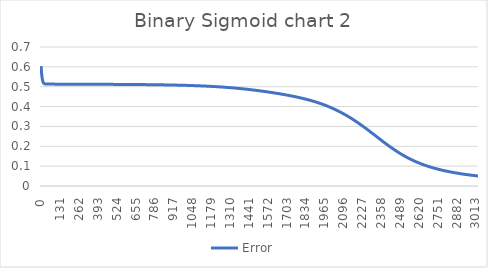
| Category | Error |
|---|---|
| 0.0 | 0.604 |
| 1.0 | 0.593 |
| 2.0 | 0.583 |
| 3.0 | 0.574 |
| 4.0 | 0.566 |
| 5.0 | 0.558 |
| 6.0 | 0.552 |
| 7.0 | 0.546 |
| 8.0 | 0.541 |
| 9.0 | 0.537 |
| 10.0 | 0.533 |
| 11.0 | 0.53 |
| 12.0 | 0.527 |
| 13.0 | 0.525 |
| 14.0 | 0.523 |
| 15.0 | 0.521 |
| 16.0 | 0.52 |
| 17.0 | 0.519 |
| 18.0 | 0.518 |
| 19.0 | 0.517 |
| 20.0 | 0.517 |
| 21.0 | 0.516 |
| 22.0 | 0.516 |
| 23.0 | 0.515 |
| 24.0 | 0.515 |
| 25.0 | 0.515 |
| 26.0 | 0.514 |
| 27.0 | 0.514 |
| 28.0 | 0.514 |
| 29.0 | 0.514 |
| 30.0 | 0.514 |
| 31.0 | 0.514 |
| 32.0 | 0.514 |
| 33.0 | 0.514 |
| 34.0 | 0.513 |
| 35.0 | 0.513 |
| 36.0 | 0.513 |
| 37.0 | 0.513 |
| 38.0 | 0.513 |
| 39.0 | 0.513 |
| 40.0 | 0.513 |
| 41.0 | 0.513 |
| 42.0 | 0.513 |
| 43.0 | 0.513 |
| 44.0 | 0.513 |
| 45.0 | 0.513 |
| 46.0 | 0.513 |
| 47.0 | 0.513 |
| 48.0 | 0.513 |
| 49.0 | 0.513 |
| 50.0 | 0.513 |
| 51.0 | 0.513 |
| 52.0 | 0.513 |
| 53.0 | 0.513 |
| 54.0 | 0.513 |
| 55.0 | 0.513 |
| 56.0 | 0.513 |
| 57.0 | 0.513 |
| 58.0 | 0.513 |
| 59.0 | 0.513 |
| 60.0 | 0.513 |
| 61.0 | 0.513 |
| 62.0 | 0.513 |
| 63.0 | 0.513 |
| 64.0 | 0.513 |
| 65.0 | 0.513 |
| 66.0 | 0.513 |
| 67.0 | 0.513 |
| 68.0 | 0.513 |
| 69.0 | 0.513 |
| 70.0 | 0.513 |
| 71.0 | 0.513 |
| 72.0 | 0.513 |
| 73.0 | 0.513 |
| 74.0 | 0.513 |
| 75.0 | 0.513 |
| 76.0 | 0.513 |
| 77.0 | 0.513 |
| 78.0 | 0.513 |
| 79.0 | 0.513 |
| 80.0 | 0.513 |
| 81.0 | 0.513 |
| 82.0 | 0.513 |
| 83.0 | 0.513 |
| 84.0 | 0.513 |
| 85.0 | 0.513 |
| 86.0 | 0.513 |
| 87.0 | 0.513 |
| 88.0 | 0.513 |
| 89.0 | 0.513 |
| 90.0 | 0.513 |
| 91.0 | 0.513 |
| 92.0 | 0.513 |
| 93.0 | 0.513 |
| 94.0 | 0.513 |
| 95.0 | 0.513 |
| 96.0 | 0.513 |
| 97.0 | 0.513 |
| 98.0 | 0.513 |
| 99.0 | 0.513 |
| 100.0 | 0.513 |
| 101.0 | 0.513 |
| 102.0 | 0.513 |
| 103.0 | 0.513 |
| 104.0 | 0.513 |
| 105.0 | 0.513 |
| 106.0 | 0.513 |
| 107.0 | 0.513 |
| 108.0 | 0.513 |
| 109.0 | 0.513 |
| 110.0 | 0.513 |
| 111.0 | 0.513 |
| 112.0 | 0.513 |
| 113.0 | 0.513 |
| 114.0 | 0.513 |
| 115.0 | 0.513 |
| 116.0 | 0.513 |
| 117.0 | 0.513 |
| 118.0 | 0.513 |
| 119.0 | 0.513 |
| 120.0 | 0.513 |
| 121.0 | 0.513 |
| 122.0 | 0.513 |
| 123.0 | 0.513 |
| 124.0 | 0.513 |
| 125.0 | 0.513 |
| 126.0 | 0.513 |
| 127.0 | 0.513 |
| 128.0 | 0.513 |
| 129.0 | 0.513 |
| 130.0 | 0.513 |
| 131.0 | 0.513 |
| 132.0 | 0.513 |
| 133.0 | 0.513 |
| 134.0 | 0.513 |
| 135.0 | 0.513 |
| 136.0 | 0.513 |
| 137.0 | 0.513 |
| 138.0 | 0.513 |
| 139.0 | 0.513 |
| 140.0 | 0.513 |
| 141.0 | 0.513 |
| 142.0 | 0.513 |
| 143.0 | 0.513 |
| 144.0 | 0.513 |
| 145.0 | 0.513 |
| 146.0 | 0.513 |
| 147.0 | 0.513 |
| 148.0 | 0.513 |
| 149.0 | 0.513 |
| 150.0 | 0.513 |
| 151.0 | 0.513 |
| 152.0 | 0.513 |
| 153.0 | 0.513 |
| 154.0 | 0.513 |
| 155.0 | 0.513 |
| 156.0 | 0.513 |
| 157.0 | 0.513 |
| 158.0 | 0.513 |
| 159.0 | 0.513 |
| 160.0 | 0.513 |
| 161.0 | 0.513 |
| 162.0 | 0.513 |
| 163.0 | 0.513 |
| 164.0 | 0.513 |
| 165.0 | 0.513 |
| 166.0 | 0.513 |
| 167.0 | 0.513 |
| 168.0 | 0.513 |
| 169.0 | 0.513 |
| 170.0 | 0.513 |
| 171.0 | 0.513 |
| 172.0 | 0.513 |
| 173.0 | 0.513 |
| 174.0 | 0.513 |
| 175.0 | 0.513 |
| 176.0 | 0.513 |
| 177.0 | 0.513 |
| 178.0 | 0.513 |
| 179.0 | 0.513 |
| 180.0 | 0.513 |
| 181.0 | 0.513 |
| 182.0 | 0.513 |
| 183.0 | 0.513 |
| 184.0 | 0.513 |
| 185.0 | 0.513 |
| 186.0 | 0.513 |
| 187.0 | 0.513 |
| 188.0 | 0.513 |
| 189.0 | 0.513 |
| 190.0 | 0.513 |
| 191.0 | 0.513 |
| 192.0 | 0.513 |
| 193.0 | 0.513 |
| 194.0 | 0.513 |
| 195.0 | 0.513 |
| 196.0 | 0.513 |
| 197.0 | 0.513 |
| 198.0 | 0.513 |
| 199.0 | 0.513 |
| 200.0 | 0.513 |
| 201.0 | 0.513 |
| 202.0 | 0.513 |
| 203.0 | 0.513 |
| 204.0 | 0.513 |
| 205.0 | 0.513 |
| 206.0 | 0.513 |
| 207.0 | 0.513 |
| 208.0 | 0.513 |
| 209.0 | 0.513 |
| 210.0 | 0.513 |
| 211.0 | 0.513 |
| 212.0 | 0.513 |
| 213.0 | 0.513 |
| 214.0 | 0.513 |
| 215.0 | 0.513 |
| 216.0 | 0.513 |
| 217.0 | 0.513 |
| 218.0 | 0.513 |
| 219.0 | 0.513 |
| 220.0 | 0.513 |
| 221.0 | 0.513 |
| 222.0 | 0.513 |
| 223.0 | 0.513 |
| 224.0 | 0.513 |
| 225.0 | 0.513 |
| 226.0 | 0.513 |
| 227.0 | 0.513 |
| 228.0 | 0.513 |
| 229.0 | 0.513 |
| 230.0 | 0.513 |
| 231.0 | 0.513 |
| 232.0 | 0.513 |
| 233.0 | 0.513 |
| 234.0 | 0.513 |
| 235.0 | 0.513 |
| 236.0 | 0.513 |
| 237.0 | 0.513 |
| 238.0 | 0.513 |
| 239.0 | 0.513 |
| 240.0 | 0.513 |
| 241.0 | 0.513 |
| 242.0 | 0.513 |
| 243.0 | 0.513 |
| 244.0 | 0.513 |
| 245.0 | 0.513 |
| 246.0 | 0.513 |
| 247.0 | 0.513 |
| 248.0 | 0.513 |
| 249.0 | 0.513 |
| 250.0 | 0.513 |
| 251.0 | 0.513 |
| 252.0 | 0.513 |
| 253.0 | 0.513 |
| 254.0 | 0.513 |
| 255.0 | 0.513 |
| 256.0 | 0.513 |
| 257.0 | 0.513 |
| 258.0 | 0.513 |
| 259.0 | 0.513 |
| 260.0 | 0.513 |
| 261.0 | 0.513 |
| 262.0 | 0.513 |
| 263.0 | 0.513 |
| 264.0 | 0.513 |
| 265.0 | 0.513 |
| 266.0 | 0.513 |
| 267.0 | 0.513 |
| 268.0 | 0.513 |
| 269.0 | 0.513 |
| 270.0 | 0.513 |
| 271.0 | 0.513 |
| 272.0 | 0.513 |
| 273.0 | 0.513 |
| 274.0 | 0.513 |
| 275.0 | 0.513 |
| 276.0 | 0.513 |
| 277.0 | 0.513 |
| 278.0 | 0.513 |
| 279.0 | 0.513 |
| 280.0 | 0.512 |
| 281.0 | 0.512 |
| 282.0 | 0.512 |
| 283.0 | 0.512 |
| 284.0 | 0.512 |
| 285.0 | 0.512 |
| 286.0 | 0.512 |
| 287.0 | 0.512 |
| 288.0 | 0.512 |
| 289.0 | 0.512 |
| 290.0 | 0.512 |
| 291.0 | 0.512 |
| 292.0 | 0.512 |
| 293.0 | 0.512 |
| 294.0 | 0.512 |
| 295.0 | 0.512 |
| 296.0 | 0.512 |
| 297.0 | 0.512 |
| 298.0 | 0.512 |
| 299.0 | 0.512 |
| 300.0 | 0.512 |
| 301.0 | 0.512 |
| 302.0 | 0.512 |
| 303.0 | 0.512 |
| 304.0 | 0.512 |
| 305.0 | 0.512 |
| 306.0 | 0.512 |
| 307.0 | 0.512 |
| 308.0 | 0.512 |
| 309.0 | 0.512 |
| 310.0 | 0.512 |
| 311.0 | 0.512 |
| 312.0 | 0.512 |
| 313.0 | 0.512 |
| 314.0 | 0.512 |
| 315.0 | 0.512 |
| 316.0 | 0.512 |
| 317.0 | 0.512 |
| 318.0 | 0.512 |
| 319.0 | 0.512 |
| 320.0 | 0.512 |
| 321.0 | 0.512 |
| 322.0 | 0.512 |
| 323.0 | 0.512 |
| 324.0 | 0.512 |
| 325.0 | 0.512 |
| 326.0 | 0.512 |
| 327.0 | 0.512 |
| 328.0 | 0.512 |
| 329.0 | 0.512 |
| 330.0 | 0.512 |
| 331.0 | 0.512 |
| 332.0 | 0.512 |
| 333.0 | 0.512 |
| 334.0 | 0.512 |
| 335.0 | 0.512 |
| 336.0 | 0.512 |
| 337.0 | 0.512 |
| 338.0 | 0.512 |
| 339.0 | 0.512 |
| 340.0 | 0.512 |
| 341.0 | 0.512 |
| 342.0 | 0.512 |
| 343.0 | 0.512 |
| 344.0 | 0.512 |
| 345.0 | 0.512 |
| 346.0 | 0.512 |
| 347.0 | 0.512 |
| 348.0 | 0.512 |
| 349.0 | 0.512 |
| 350.0 | 0.512 |
| 351.0 | 0.512 |
| 352.0 | 0.512 |
| 353.0 | 0.512 |
| 354.0 | 0.512 |
| 355.0 | 0.512 |
| 356.0 | 0.512 |
| 357.0 | 0.512 |
| 358.0 | 0.512 |
| 359.0 | 0.512 |
| 360.0 | 0.512 |
| 361.0 | 0.512 |
| 362.0 | 0.512 |
| 363.0 | 0.512 |
| 364.0 | 0.512 |
| 365.0 | 0.512 |
| 366.0 | 0.512 |
| 367.0 | 0.512 |
| 368.0 | 0.512 |
| 369.0 | 0.512 |
| 370.0 | 0.512 |
| 371.0 | 0.512 |
| 372.0 | 0.512 |
| 373.0 | 0.512 |
| 374.0 | 0.512 |
| 375.0 | 0.512 |
| 376.0 | 0.512 |
| 377.0 | 0.512 |
| 378.0 | 0.512 |
| 379.0 | 0.512 |
| 380.0 | 0.512 |
| 381.0 | 0.512 |
| 382.0 | 0.512 |
| 383.0 | 0.512 |
| 384.0 | 0.512 |
| 385.0 | 0.512 |
| 386.0 | 0.512 |
| 387.0 | 0.512 |
| 388.0 | 0.512 |
| 389.0 | 0.512 |
| 390.0 | 0.512 |
| 391.0 | 0.512 |
| 392.0 | 0.512 |
| 393.0 | 0.512 |
| 394.0 | 0.512 |
| 395.0 | 0.512 |
| 396.0 | 0.512 |
| 397.0 | 0.512 |
| 398.0 | 0.512 |
| 399.0 | 0.512 |
| 400.0 | 0.512 |
| 401.0 | 0.512 |
| 402.0 | 0.512 |
| 403.0 | 0.512 |
| 404.0 | 0.512 |
| 405.0 | 0.512 |
| 406.0 | 0.512 |
| 407.0 | 0.512 |
| 408.0 | 0.512 |
| 409.0 | 0.512 |
| 410.0 | 0.512 |
| 411.0 | 0.512 |
| 412.0 | 0.512 |
| 413.0 | 0.512 |
| 414.0 | 0.512 |
| 415.0 | 0.512 |
| 416.0 | 0.512 |
| 417.0 | 0.512 |
| 418.0 | 0.512 |
| 419.0 | 0.512 |
| 420.0 | 0.512 |
| 421.0 | 0.512 |
| 422.0 | 0.512 |
| 423.0 | 0.512 |
| 424.0 | 0.512 |
| 425.0 | 0.512 |
| 426.0 | 0.512 |
| 427.0 | 0.512 |
| 428.0 | 0.512 |
| 429.0 | 0.512 |
| 430.0 | 0.512 |
| 431.0 | 0.512 |
| 432.0 | 0.512 |
| 433.0 | 0.512 |
| 434.0 | 0.512 |
| 435.0 | 0.512 |
| 436.0 | 0.512 |
| 437.0 | 0.512 |
| 438.0 | 0.512 |
| 439.0 | 0.512 |
| 440.0 | 0.512 |
| 441.0 | 0.512 |
| 442.0 | 0.512 |
| 443.0 | 0.512 |
| 444.0 | 0.512 |
| 445.0 | 0.512 |
| 446.0 | 0.512 |
| 447.0 | 0.512 |
| 448.0 | 0.512 |
| 449.0 | 0.512 |
| 450.0 | 0.512 |
| 451.0 | 0.512 |
| 452.0 | 0.512 |
| 453.0 | 0.512 |
| 454.0 | 0.512 |
| 455.0 | 0.512 |
| 456.0 | 0.512 |
| 457.0 | 0.512 |
| 458.0 | 0.512 |
| 459.0 | 0.512 |
| 460.0 | 0.512 |
| 461.0 | 0.512 |
| 462.0 | 0.512 |
| 463.0 | 0.512 |
| 464.0 | 0.512 |
| 465.0 | 0.512 |
| 466.0 | 0.512 |
| 467.0 | 0.512 |
| 468.0 | 0.512 |
| 469.0 | 0.512 |
| 470.0 | 0.512 |
| 471.0 | 0.512 |
| 472.0 | 0.512 |
| 473.0 | 0.512 |
| 474.0 | 0.512 |
| 475.0 | 0.512 |
| 476.0 | 0.512 |
| 477.0 | 0.512 |
| 478.0 | 0.512 |
| 479.0 | 0.512 |
| 480.0 | 0.512 |
| 481.0 | 0.512 |
| 482.0 | 0.512 |
| 483.0 | 0.512 |
| 484.0 | 0.512 |
| 485.0 | 0.512 |
| 486.0 | 0.512 |
| 487.0 | 0.512 |
| 488.0 | 0.512 |
| 489.0 | 0.512 |
| 490.0 | 0.512 |
| 491.0 | 0.512 |
| 492.0 | 0.512 |
| 493.0 | 0.512 |
| 494.0 | 0.512 |
| 495.0 | 0.512 |
| 496.0 | 0.512 |
| 497.0 | 0.512 |
| 498.0 | 0.512 |
| 499.0 | 0.512 |
| 500.0 | 0.512 |
| 501.0 | 0.512 |
| 502.0 | 0.512 |
| 503.0 | 0.512 |
| 504.0 | 0.512 |
| 505.0 | 0.512 |
| 506.0 | 0.512 |
| 507.0 | 0.512 |
| 508.0 | 0.512 |
| 509.0 | 0.512 |
| 510.0 | 0.512 |
| 511.0 | 0.512 |
| 512.0 | 0.512 |
| 513.0 | 0.512 |
| 514.0 | 0.512 |
| 515.0 | 0.512 |
| 516.0 | 0.512 |
| 517.0 | 0.512 |
| 518.0 | 0.512 |
| 519.0 | 0.512 |
| 520.0 | 0.512 |
| 521.0 | 0.512 |
| 522.0 | 0.512 |
| 523.0 | 0.512 |
| 524.0 | 0.512 |
| 525.0 | 0.512 |
| 526.0 | 0.512 |
| 527.0 | 0.512 |
| 528.0 | 0.512 |
| 529.0 | 0.512 |
| 530.0 | 0.512 |
| 531.0 | 0.512 |
| 532.0 | 0.512 |
| 533.0 | 0.512 |
| 534.0 | 0.512 |
| 535.0 | 0.512 |
| 536.0 | 0.512 |
| 537.0 | 0.512 |
| 538.0 | 0.512 |
| 539.0 | 0.512 |
| 540.0 | 0.512 |
| 541.0 | 0.512 |
| 542.0 | 0.512 |
| 543.0 | 0.512 |
| 544.0 | 0.512 |
| 545.0 | 0.512 |
| 546.0 | 0.512 |
| 547.0 | 0.512 |
| 548.0 | 0.512 |
| 549.0 | 0.512 |
| 550.0 | 0.512 |
| 551.0 | 0.512 |
| 552.0 | 0.512 |
| 553.0 | 0.512 |
| 554.0 | 0.512 |
| 555.0 | 0.512 |
| 556.0 | 0.512 |
| 557.0 | 0.512 |
| 558.0 | 0.512 |
| 559.0 | 0.512 |
| 560.0 | 0.512 |
| 561.0 | 0.512 |
| 562.0 | 0.512 |
| 563.0 | 0.512 |
| 564.0 | 0.512 |
| 565.0 | 0.512 |
| 566.0 | 0.512 |
| 567.0 | 0.511 |
| 568.0 | 0.511 |
| 569.0 | 0.511 |
| 570.0 | 0.511 |
| 571.0 | 0.511 |
| 572.0 | 0.511 |
| 573.0 | 0.511 |
| 574.0 | 0.511 |
| 575.0 | 0.511 |
| 576.0 | 0.511 |
| 577.0 | 0.511 |
| 578.0 | 0.511 |
| 579.0 | 0.511 |
| 580.0 | 0.511 |
| 581.0 | 0.511 |
| 582.0 | 0.511 |
| 583.0 | 0.511 |
| 584.0 | 0.511 |
| 585.0 | 0.511 |
| 586.0 | 0.511 |
| 587.0 | 0.511 |
| 588.0 | 0.511 |
| 589.0 | 0.511 |
| 590.0 | 0.511 |
| 591.0 | 0.511 |
| 592.0 | 0.511 |
| 593.0 | 0.511 |
| 594.0 | 0.511 |
| 595.0 | 0.511 |
| 596.0 | 0.511 |
| 597.0 | 0.511 |
| 598.0 | 0.511 |
| 599.0 | 0.511 |
| 600.0 | 0.511 |
| 601.0 | 0.511 |
| 602.0 | 0.511 |
| 603.0 | 0.511 |
| 604.0 | 0.511 |
| 605.0 | 0.511 |
| 606.0 | 0.511 |
| 607.0 | 0.511 |
| 608.0 | 0.511 |
| 609.0 | 0.511 |
| 610.0 | 0.511 |
| 611.0 | 0.511 |
| 612.0 | 0.511 |
| 613.0 | 0.511 |
| 614.0 | 0.511 |
| 615.0 | 0.511 |
| 616.0 | 0.511 |
| 617.0 | 0.511 |
| 618.0 | 0.511 |
| 619.0 | 0.511 |
| 620.0 | 0.511 |
| 621.0 | 0.511 |
| 622.0 | 0.511 |
| 623.0 | 0.511 |
| 624.0 | 0.511 |
| 625.0 | 0.511 |
| 626.0 | 0.511 |
| 627.0 | 0.511 |
| 628.0 | 0.511 |
| 629.0 | 0.511 |
| 630.0 | 0.511 |
| 631.0 | 0.511 |
| 632.0 | 0.511 |
| 633.0 | 0.511 |
| 634.0 | 0.511 |
| 635.0 | 0.511 |
| 636.0 | 0.511 |
| 637.0 | 0.511 |
| 638.0 | 0.511 |
| 639.0 | 0.511 |
| 640.0 | 0.511 |
| 641.0 | 0.511 |
| 642.0 | 0.511 |
| 643.0 | 0.511 |
| 644.0 | 0.511 |
| 645.0 | 0.511 |
| 646.0 | 0.511 |
| 647.0 | 0.511 |
| 648.0 | 0.511 |
| 649.0 | 0.511 |
| 650.0 | 0.511 |
| 651.0 | 0.511 |
| 652.0 | 0.511 |
| 653.0 | 0.511 |
| 654.0 | 0.511 |
| 655.0 | 0.511 |
| 656.0 | 0.511 |
| 657.0 | 0.511 |
| 658.0 | 0.511 |
| 659.0 | 0.511 |
| 660.0 | 0.511 |
| 661.0 | 0.511 |
| 662.0 | 0.511 |
| 663.0 | 0.511 |
| 664.0 | 0.511 |
| 665.0 | 0.511 |
| 666.0 | 0.511 |
| 667.0 | 0.511 |
| 668.0 | 0.511 |
| 669.0 | 0.511 |
| 670.0 | 0.511 |
| 671.0 | 0.511 |
| 672.0 | 0.511 |
| 673.0 | 0.511 |
| 674.0 | 0.511 |
| 675.0 | 0.511 |
| 676.0 | 0.511 |
| 677.0 | 0.511 |
| 678.0 | 0.511 |
| 679.0 | 0.511 |
| 680.0 | 0.511 |
| 681.0 | 0.511 |
| 682.0 | 0.511 |
| 683.0 | 0.511 |
| 684.0 | 0.511 |
| 685.0 | 0.511 |
| 686.0 | 0.511 |
| 687.0 | 0.511 |
| 688.0 | 0.511 |
| 689.0 | 0.511 |
| 690.0 | 0.511 |
| 691.0 | 0.511 |
| 692.0 | 0.511 |
| 693.0 | 0.511 |
| 694.0 | 0.511 |
| 695.0 | 0.511 |
| 696.0 | 0.511 |
| 697.0 | 0.511 |
| 698.0 | 0.511 |
| 699.0 | 0.511 |
| 700.0 | 0.511 |
| 701.0 | 0.511 |
| 702.0 | 0.511 |
| 703.0 | 0.511 |
| 704.0 | 0.511 |
| 705.0 | 0.511 |
| 706.0 | 0.511 |
| 707.0 | 0.511 |
| 708.0 | 0.511 |
| 709.0 | 0.511 |
| 710.0 | 0.511 |
| 711.0 | 0.511 |
| 712.0 | 0.511 |
| 713.0 | 0.511 |
| 714.0 | 0.511 |
| 715.0 | 0.511 |
| 716.0 | 0.511 |
| 717.0 | 0.511 |
| 718.0 | 0.511 |
| 719.0 | 0.511 |
| 720.0 | 0.511 |
| 721.0 | 0.511 |
| 722.0 | 0.511 |
| 723.0 | 0.511 |
| 724.0 | 0.511 |
| 725.0 | 0.511 |
| 726.0 | 0.511 |
| 727.0 | 0.511 |
| 728.0 | 0.511 |
| 729.0 | 0.51 |
| 730.0 | 0.51 |
| 731.0 | 0.51 |
| 732.0 | 0.51 |
| 733.0 | 0.51 |
| 734.0 | 0.51 |
| 735.0 | 0.51 |
| 736.0 | 0.51 |
| 737.0 | 0.51 |
| 738.0 | 0.51 |
| 739.0 | 0.51 |
| 740.0 | 0.51 |
| 741.0 | 0.51 |
| 742.0 | 0.51 |
| 743.0 | 0.51 |
| 744.0 | 0.51 |
| 745.0 | 0.51 |
| 746.0 | 0.51 |
| 747.0 | 0.51 |
| 748.0 | 0.51 |
| 749.0 | 0.51 |
| 750.0 | 0.51 |
| 751.0 | 0.51 |
| 752.0 | 0.51 |
| 753.0 | 0.51 |
| 754.0 | 0.51 |
| 755.0 | 0.51 |
| 756.0 | 0.51 |
| 757.0 | 0.51 |
| 758.0 | 0.51 |
| 759.0 | 0.51 |
| 760.0 | 0.51 |
| 761.0 | 0.51 |
| 762.0 | 0.51 |
| 763.0 | 0.51 |
| 764.0 | 0.51 |
| 765.0 | 0.51 |
| 766.0 | 0.51 |
| 767.0 | 0.51 |
| 768.0 | 0.51 |
| 769.0 | 0.51 |
| 770.0 | 0.51 |
| 771.0 | 0.51 |
| 772.0 | 0.51 |
| 773.0 | 0.51 |
| 774.0 | 0.51 |
| 775.0 | 0.51 |
| 776.0 | 0.51 |
| 777.0 | 0.51 |
| 778.0 | 0.51 |
| 779.0 | 0.51 |
| 780.0 | 0.51 |
| 781.0 | 0.51 |
| 782.0 | 0.51 |
| 783.0 | 0.51 |
| 784.0 | 0.51 |
| 785.0 | 0.51 |
| 786.0 | 0.51 |
| 787.0 | 0.51 |
| 788.0 | 0.51 |
| 789.0 | 0.51 |
| 790.0 | 0.51 |
| 791.0 | 0.51 |
| 792.0 | 0.51 |
| 793.0 | 0.51 |
| 794.0 | 0.51 |
| 795.0 | 0.51 |
| 796.0 | 0.51 |
| 797.0 | 0.51 |
| 798.0 | 0.51 |
| 799.0 | 0.51 |
| 800.0 | 0.51 |
| 801.0 | 0.51 |
| 802.0 | 0.51 |
| 803.0 | 0.51 |
| 804.0 | 0.51 |
| 805.0 | 0.51 |
| 806.0 | 0.51 |
| 807.0 | 0.51 |
| 808.0 | 0.51 |
| 809.0 | 0.51 |
| 810.0 | 0.51 |
| 811.0 | 0.51 |
| 812.0 | 0.51 |
| 813.0 | 0.51 |
| 814.0 | 0.51 |
| 815.0 | 0.51 |
| 816.0 | 0.51 |
| 817.0 | 0.51 |
| 818.0 | 0.51 |
| 819.0 | 0.51 |
| 820.0 | 0.51 |
| 821.0 | 0.51 |
| 822.0 | 0.51 |
| 823.0 | 0.51 |
| 824.0 | 0.51 |
| 825.0 | 0.51 |
| 826.0 | 0.51 |
| 827.0 | 0.51 |
| 828.0 | 0.51 |
| 829.0 | 0.51 |
| 830.0 | 0.51 |
| 831.0 | 0.51 |
| 832.0 | 0.51 |
| 833.0 | 0.51 |
| 834.0 | 0.509 |
| 835.0 | 0.509 |
| 836.0 | 0.509 |
| 837.0 | 0.509 |
| 838.0 | 0.509 |
| 839.0 | 0.509 |
| 840.0 | 0.509 |
| 841.0 | 0.509 |
| 842.0 | 0.509 |
| 843.0 | 0.509 |
| 844.0 | 0.509 |
| 845.0 | 0.509 |
| 846.0 | 0.509 |
| 847.0 | 0.509 |
| 848.0 | 0.509 |
| 849.0 | 0.509 |
| 850.0 | 0.509 |
| 851.0 | 0.509 |
| 852.0 | 0.509 |
| 853.0 | 0.509 |
| 854.0 | 0.509 |
| 855.0 | 0.509 |
| 856.0 | 0.509 |
| 857.0 | 0.509 |
| 858.0 | 0.509 |
| 859.0 | 0.509 |
| 860.0 | 0.509 |
| 861.0 | 0.509 |
| 862.0 | 0.509 |
| 863.0 | 0.509 |
| 864.0 | 0.509 |
| 865.0 | 0.509 |
| 866.0 | 0.509 |
| 867.0 | 0.509 |
| 868.0 | 0.509 |
| 869.0 | 0.509 |
| 870.0 | 0.509 |
| 871.0 | 0.509 |
| 872.0 | 0.509 |
| 873.0 | 0.509 |
| 874.0 | 0.509 |
| 875.0 | 0.509 |
| 876.0 | 0.509 |
| 877.0 | 0.509 |
| 878.0 | 0.509 |
| 879.0 | 0.509 |
| 880.0 | 0.509 |
| 881.0 | 0.509 |
| 882.0 | 0.509 |
| 883.0 | 0.509 |
| 884.0 | 0.509 |
| 885.0 | 0.509 |
| 886.0 | 0.509 |
| 887.0 | 0.509 |
| 888.0 | 0.509 |
| 889.0 | 0.509 |
| 890.0 | 0.509 |
| 891.0 | 0.509 |
| 892.0 | 0.509 |
| 893.0 | 0.509 |
| 894.0 | 0.509 |
| 895.0 | 0.509 |
| 896.0 | 0.509 |
| 897.0 | 0.509 |
| 898.0 | 0.509 |
| 899.0 | 0.509 |
| 900.0 | 0.509 |
| 901.0 | 0.509 |
| 902.0 | 0.509 |
| 903.0 | 0.509 |
| 904.0 | 0.509 |
| 905.0 | 0.509 |
| 906.0 | 0.509 |
| 907.0 | 0.509 |
| 908.0 | 0.509 |
| 909.0 | 0.509 |
| 910.0 | 0.509 |
| 911.0 | 0.508 |
| 912.0 | 0.508 |
| 913.0 | 0.508 |
| 914.0 | 0.508 |
| 915.0 | 0.508 |
| 916.0 | 0.508 |
| 917.0 | 0.508 |
| 918.0 | 0.508 |
| 919.0 | 0.508 |
| 920.0 | 0.508 |
| 921.0 | 0.508 |
| 922.0 | 0.508 |
| 923.0 | 0.508 |
| 924.0 | 0.508 |
| 925.0 | 0.508 |
| 926.0 | 0.508 |
| 927.0 | 0.508 |
| 928.0 | 0.508 |
| 929.0 | 0.508 |
| 930.0 | 0.508 |
| 931.0 | 0.508 |
| 932.0 | 0.508 |
| 933.0 | 0.508 |
| 934.0 | 0.508 |
| 935.0 | 0.508 |
| 936.0 | 0.508 |
| 937.0 | 0.508 |
| 938.0 | 0.508 |
| 939.0 | 0.508 |
| 940.0 | 0.508 |
| 941.0 | 0.508 |
| 942.0 | 0.508 |
| 943.0 | 0.508 |
| 944.0 | 0.508 |
| 945.0 | 0.508 |
| 946.0 | 0.508 |
| 947.0 | 0.508 |
| 948.0 | 0.508 |
| 949.0 | 0.508 |
| 950.0 | 0.508 |
| 951.0 | 0.508 |
| 952.0 | 0.508 |
| 953.0 | 0.508 |
| 954.0 | 0.508 |
| 955.0 | 0.508 |
| 956.0 | 0.508 |
| 957.0 | 0.508 |
| 958.0 | 0.508 |
| 959.0 | 0.508 |
| 960.0 | 0.508 |
| 961.0 | 0.508 |
| 962.0 | 0.508 |
| 963.0 | 0.508 |
| 964.0 | 0.508 |
| 965.0 | 0.508 |
| 966.0 | 0.508 |
| 967.0 | 0.508 |
| 968.0 | 0.508 |
| 969.0 | 0.508 |
| 970.0 | 0.507 |
| 971.0 | 0.507 |
| 972.0 | 0.507 |
| 973.0 | 0.507 |
| 974.0 | 0.507 |
| 975.0 | 0.507 |
| 976.0 | 0.507 |
| 977.0 | 0.507 |
| 978.0 | 0.507 |
| 979.0 | 0.507 |
| 980.0 | 0.507 |
| 981.0 | 0.507 |
| 982.0 | 0.507 |
| 983.0 | 0.507 |
| 984.0 | 0.507 |
| 985.0 | 0.507 |
| 986.0 | 0.507 |
| 987.0 | 0.507 |
| 988.0 | 0.507 |
| 989.0 | 0.507 |
| 990.0 | 0.507 |
| 991.0 | 0.507 |
| 992.0 | 0.507 |
| 993.0 | 0.507 |
| 994.0 | 0.507 |
| 995.0 | 0.507 |
| 996.0 | 0.507 |
| 997.0 | 0.507 |
| 998.0 | 0.507 |
| 999.0 | 0.507 |
| 1000.0 | 0.507 |
| 1001.0 | 0.507 |
| 1002.0 | 0.507 |
| 1003.0 | 0.507 |
| 1004.0 | 0.507 |
| 1005.0 | 0.507 |
| 1006.0 | 0.507 |
| 1007.0 | 0.507 |
| 1008.0 | 0.507 |
| 1009.0 | 0.507 |
| 1010.0 | 0.507 |
| 1011.0 | 0.507 |
| 1012.0 | 0.507 |
| 1013.0 | 0.507 |
| 1014.0 | 0.507 |
| 1015.0 | 0.507 |
| 1016.0 | 0.507 |
| 1017.0 | 0.507 |
| 1018.0 | 0.507 |
| 1019.0 | 0.506 |
| 1020.0 | 0.506 |
| 1021.0 | 0.506 |
| 1022.0 | 0.506 |
| 1023.0 | 0.506 |
| 1024.0 | 0.506 |
| 1025.0 | 0.506 |
| 1026.0 | 0.506 |
| 1027.0 | 0.506 |
| 1028.0 | 0.506 |
| 1029.0 | 0.506 |
| 1030.0 | 0.506 |
| 1031.0 | 0.506 |
| 1032.0 | 0.506 |
| 1033.0 | 0.506 |
| 1034.0 | 0.506 |
| 1035.0 | 0.506 |
| 1036.0 | 0.506 |
| 1037.0 | 0.506 |
| 1038.0 | 0.506 |
| 1039.0 | 0.506 |
| 1040.0 | 0.506 |
| 1041.0 | 0.506 |
| 1042.0 | 0.506 |
| 1043.0 | 0.506 |
| 1044.0 | 0.506 |
| 1045.0 | 0.506 |
| 1046.0 | 0.506 |
| 1047.0 | 0.506 |
| 1048.0 | 0.506 |
| 1049.0 | 0.506 |
| 1050.0 | 0.506 |
| 1051.0 | 0.506 |
| 1052.0 | 0.506 |
| 1053.0 | 0.506 |
| 1054.0 | 0.506 |
| 1055.0 | 0.506 |
| 1056.0 | 0.506 |
| 1057.0 | 0.506 |
| 1058.0 | 0.506 |
| 1059.0 | 0.506 |
| 1060.0 | 0.506 |
| 1061.0 | 0.505 |
| 1062.0 | 0.505 |
| 1063.0 | 0.505 |
| 1064.0 | 0.505 |
| 1065.0 | 0.505 |
| 1066.0 | 0.505 |
| 1067.0 | 0.505 |
| 1068.0 | 0.505 |
| 1069.0 | 0.505 |
| 1070.0 | 0.505 |
| 1071.0 | 0.505 |
| 1072.0 | 0.505 |
| 1073.0 | 0.505 |
| 1074.0 | 0.505 |
| 1075.0 | 0.505 |
| 1076.0 | 0.505 |
| 1077.0 | 0.505 |
| 1078.0 | 0.505 |
| 1079.0 | 0.505 |
| 1080.0 | 0.505 |
| 1081.0 | 0.505 |
| 1082.0 | 0.505 |
| 1083.0 | 0.505 |
| 1084.0 | 0.505 |
| 1085.0 | 0.505 |
| 1086.0 | 0.505 |
| 1087.0 | 0.505 |
| 1088.0 | 0.505 |
| 1089.0 | 0.505 |
| 1090.0 | 0.505 |
| 1091.0 | 0.505 |
| 1092.0 | 0.505 |
| 1093.0 | 0.505 |
| 1094.0 | 0.505 |
| 1095.0 | 0.505 |
| 1096.0 | 0.505 |
| 1097.0 | 0.504 |
| 1098.0 | 0.504 |
| 1099.0 | 0.504 |
| 1100.0 | 0.504 |
| 1101.0 | 0.504 |
| 1102.0 | 0.504 |
| 1103.0 | 0.504 |
| 1104.0 | 0.504 |
| 1105.0 | 0.504 |
| 1106.0 | 0.504 |
| 1107.0 | 0.504 |
| 1108.0 | 0.504 |
| 1109.0 | 0.504 |
| 1110.0 | 0.504 |
| 1111.0 | 0.504 |
| 1112.0 | 0.504 |
| 1113.0 | 0.504 |
| 1114.0 | 0.504 |
| 1115.0 | 0.504 |
| 1116.0 | 0.504 |
| 1117.0 | 0.504 |
| 1118.0 | 0.504 |
| 1119.0 | 0.504 |
| 1120.0 | 0.504 |
| 1121.0 | 0.504 |
| 1122.0 | 0.504 |
| 1123.0 | 0.504 |
| 1124.0 | 0.504 |
| 1125.0 | 0.504 |
| 1126.0 | 0.504 |
| 1127.0 | 0.504 |
| 1128.0 | 0.504 |
| 1129.0 | 0.503 |
| 1130.0 | 0.503 |
| 1131.0 | 0.503 |
| 1132.0 | 0.503 |
| 1133.0 | 0.503 |
| 1134.0 | 0.503 |
| 1135.0 | 0.503 |
| 1136.0 | 0.503 |
| 1137.0 | 0.503 |
| 1138.0 | 0.503 |
| 1139.0 | 0.503 |
| 1140.0 | 0.503 |
| 1141.0 | 0.503 |
| 1142.0 | 0.503 |
| 1143.0 | 0.503 |
| 1144.0 | 0.503 |
| 1145.0 | 0.503 |
| 1146.0 | 0.503 |
| 1147.0 | 0.503 |
| 1148.0 | 0.503 |
| 1149.0 | 0.503 |
| 1150.0 | 0.503 |
| 1151.0 | 0.503 |
| 1152.0 | 0.503 |
| 1153.0 | 0.503 |
| 1154.0 | 0.503 |
| 1155.0 | 0.503 |
| 1156.0 | 0.503 |
| 1157.0 | 0.503 |
| 1158.0 | 0.502 |
| 1159.0 | 0.502 |
| 1160.0 | 0.502 |
| 1161.0 | 0.502 |
| 1162.0 | 0.502 |
| 1163.0 | 0.502 |
| 1164.0 | 0.502 |
| 1165.0 | 0.502 |
| 1166.0 | 0.502 |
| 1167.0 | 0.502 |
| 1168.0 | 0.502 |
| 1169.0 | 0.502 |
| 1170.0 | 0.502 |
| 1171.0 | 0.502 |
| 1172.0 | 0.502 |
| 1173.0 | 0.502 |
| 1174.0 | 0.502 |
| 1175.0 | 0.502 |
| 1176.0 | 0.502 |
| 1177.0 | 0.502 |
| 1178.0 | 0.502 |
| 1179.0 | 0.502 |
| 1180.0 | 0.502 |
| 1181.0 | 0.502 |
| 1182.0 | 0.502 |
| 1183.0 | 0.502 |
| 1184.0 | 0.502 |
| 1185.0 | 0.501 |
| 1186.0 | 0.501 |
| 1187.0 | 0.501 |
| 1188.0 | 0.501 |
| 1189.0 | 0.501 |
| 1190.0 | 0.501 |
| 1191.0 | 0.501 |
| 1192.0 | 0.501 |
| 1193.0 | 0.501 |
| 1194.0 | 0.501 |
| 1195.0 | 0.501 |
| 1196.0 | 0.501 |
| 1197.0 | 0.501 |
| 1198.0 | 0.501 |
| 1199.0 | 0.501 |
| 1200.0 | 0.501 |
| 1201.0 | 0.501 |
| 1202.0 | 0.501 |
| 1203.0 | 0.501 |
| 1204.0 | 0.501 |
| 1205.0 | 0.501 |
| 1206.0 | 0.501 |
| 1207.0 | 0.501 |
| 1208.0 | 0.501 |
| 1209.0 | 0.5 |
| 1210.0 | 0.5 |
| 1211.0 | 0.5 |
| 1212.0 | 0.5 |
| 1213.0 | 0.5 |
| 1214.0 | 0.5 |
| 1215.0 | 0.5 |
| 1216.0 | 0.5 |
| 1217.0 | 0.5 |
| 1218.0 | 0.5 |
| 1219.0 | 0.5 |
| 1220.0 | 0.5 |
| 1221.0 | 0.5 |
| 1222.0 | 0.5 |
| 1223.0 | 0.5 |
| 1224.0 | 0.5 |
| 1225.0 | 0.5 |
| 1226.0 | 0.5 |
| 1227.0 | 0.5 |
| 1228.0 | 0.5 |
| 1229.0 | 0.5 |
| 1230.0 | 0.5 |
| 1231.0 | 0.499 |
| 1232.0 | 0.499 |
| 1233.0 | 0.499 |
| 1234.0 | 0.499 |
| 1235.0 | 0.499 |
| 1236.0 | 0.499 |
| 1237.0 | 0.499 |
| 1238.0 | 0.499 |
| 1239.0 | 0.499 |
| 1240.0 | 0.499 |
| 1241.0 | 0.499 |
| 1242.0 | 0.499 |
| 1243.0 | 0.499 |
| 1244.0 | 0.499 |
| 1245.0 | 0.499 |
| 1246.0 | 0.499 |
| 1247.0 | 0.499 |
| 1248.0 | 0.499 |
| 1249.0 | 0.499 |
| 1250.0 | 0.499 |
| 1251.0 | 0.499 |
| 1252.0 | 0.498 |
| 1253.0 | 0.498 |
| 1254.0 | 0.498 |
| 1255.0 | 0.498 |
| 1256.0 | 0.498 |
| 1257.0 | 0.498 |
| 1258.0 | 0.498 |
| 1259.0 | 0.498 |
| 1260.0 | 0.498 |
| 1261.0 | 0.498 |
| 1262.0 | 0.498 |
| 1263.0 | 0.498 |
| 1264.0 | 0.498 |
| 1265.0 | 0.498 |
| 1266.0 | 0.498 |
| 1267.0 | 0.498 |
| 1268.0 | 0.498 |
| 1269.0 | 0.498 |
| 1270.0 | 0.498 |
| 1271.0 | 0.497 |
| 1272.0 | 0.497 |
| 1273.0 | 0.497 |
| 1274.0 | 0.497 |
| 1275.0 | 0.497 |
| 1276.0 | 0.497 |
| 1277.0 | 0.497 |
| 1278.0 | 0.497 |
| 1279.0 | 0.497 |
| 1280.0 | 0.497 |
| 1281.0 | 0.497 |
| 1282.0 | 0.497 |
| 1283.0 | 0.497 |
| 1284.0 | 0.497 |
| 1285.0 | 0.497 |
| 1286.0 | 0.497 |
| 1287.0 | 0.497 |
| 1288.0 | 0.497 |
| 1289.0 | 0.497 |
| 1290.0 | 0.496 |
| 1291.0 | 0.496 |
| 1292.0 | 0.496 |
| 1293.0 | 0.496 |
| 1294.0 | 0.496 |
| 1295.0 | 0.496 |
| 1296.0 | 0.496 |
| 1297.0 | 0.496 |
| 1298.0 | 0.496 |
| 1299.0 | 0.496 |
| 1300.0 | 0.496 |
| 1301.0 | 0.496 |
| 1302.0 | 0.496 |
| 1303.0 | 0.496 |
| 1304.0 | 0.496 |
| 1305.0 | 0.496 |
| 1306.0 | 0.496 |
| 1307.0 | 0.495 |
| 1308.0 | 0.495 |
| 1309.0 | 0.495 |
| 1310.0 | 0.495 |
| 1311.0 | 0.495 |
| 1312.0 | 0.495 |
| 1313.0 | 0.495 |
| 1314.0 | 0.495 |
| 1315.0 | 0.495 |
| 1316.0 | 0.495 |
| 1317.0 | 0.495 |
| 1318.0 | 0.495 |
| 1319.0 | 0.495 |
| 1320.0 | 0.495 |
| 1321.0 | 0.495 |
| 1322.0 | 0.495 |
| 1323.0 | 0.495 |
| 1324.0 | 0.494 |
| 1325.0 | 0.494 |
| 1326.0 | 0.494 |
| 1327.0 | 0.494 |
| 1328.0 | 0.494 |
| 1329.0 | 0.494 |
| 1330.0 | 0.494 |
| 1331.0 | 0.494 |
| 1332.0 | 0.494 |
| 1333.0 | 0.494 |
| 1334.0 | 0.494 |
| 1335.0 | 0.494 |
| 1336.0 | 0.494 |
| 1337.0 | 0.494 |
| 1338.0 | 0.494 |
| 1339.0 | 0.494 |
| 1340.0 | 0.493 |
| 1341.0 | 0.493 |
| 1342.0 | 0.493 |
| 1343.0 | 0.493 |
| 1344.0 | 0.493 |
| 1345.0 | 0.493 |
| 1346.0 | 0.493 |
| 1347.0 | 0.493 |
| 1348.0 | 0.493 |
| 1349.0 | 0.493 |
| 1350.0 | 0.493 |
| 1351.0 | 0.493 |
| 1352.0 | 0.493 |
| 1353.0 | 0.493 |
| 1354.0 | 0.493 |
| 1355.0 | 0.492 |
| 1356.0 | 0.492 |
| 1357.0 | 0.492 |
| 1358.0 | 0.492 |
| 1359.0 | 0.492 |
| 1360.0 | 0.492 |
| 1361.0 | 0.492 |
| 1362.0 | 0.492 |
| 1363.0 | 0.492 |
| 1364.0 | 0.492 |
| 1365.0 | 0.492 |
| 1366.0 | 0.492 |
| 1367.0 | 0.492 |
| 1368.0 | 0.492 |
| 1369.0 | 0.492 |
| 1370.0 | 0.491 |
| 1371.0 | 0.491 |
| 1372.0 | 0.491 |
| 1373.0 | 0.491 |
| 1374.0 | 0.491 |
| 1375.0 | 0.491 |
| 1376.0 | 0.491 |
| 1377.0 | 0.491 |
| 1378.0 | 0.491 |
| 1379.0 | 0.491 |
| 1380.0 | 0.491 |
| 1381.0 | 0.491 |
| 1382.0 | 0.491 |
| 1383.0 | 0.491 |
| 1384.0 | 0.49 |
| 1385.0 | 0.49 |
| 1386.0 | 0.49 |
| 1387.0 | 0.49 |
| 1388.0 | 0.49 |
| 1389.0 | 0.49 |
| 1390.0 | 0.49 |
| 1391.0 | 0.49 |
| 1392.0 | 0.49 |
| 1393.0 | 0.49 |
| 1394.0 | 0.49 |
| 1395.0 | 0.49 |
| 1396.0 | 0.49 |
| 1397.0 | 0.489 |
| 1398.0 | 0.489 |
| 1399.0 | 0.489 |
| 1400.0 | 0.489 |
| 1401.0 | 0.489 |
| 1402.0 | 0.489 |
| 1403.0 | 0.489 |
| 1404.0 | 0.489 |
| 1405.0 | 0.489 |
| 1406.0 | 0.489 |
| 1407.0 | 0.489 |
| 1408.0 | 0.489 |
| 1409.0 | 0.489 |
| 1410.0 | 0.489 |
| 1411.0 | 0.488 |
| 1412.0 | 0.488 |
| 1413.0 | 0.488 |
| 1414.0 | 0.488 |
| 1415.0 | 0.488 |
| 1416.0 | 0.488 |
| 1417.0 | 0.488 |
| 1418.0 | 0.488 |
| 1419.0 | 0.488 |
| 1420.0 | 0.488 |
| 1421.0 | 0.488 |
| 1422.0 | 0.488 |
| 1423.0 | 0.487 |
| 1424.0 | 0.487 |
| 1425.0 | 0.487 |
| 1426.0 | 0.487 |
| 1427.0 | 0.487 |
| 1428.0 | 0.487 |
| 1429.0 | 0.487 |
| 1430.0 | 0.487 |
| 1431.0 | 0.487 |
| 1432.0 | 0.487 |
| 1433.0 | 0.487 |
| 1434.0 | 0.487 |
| 1435.0 | 0.487 |
| 1436.0 | 0.486 |
| 1437.0 | 0.486 |
| 1438.0 | 0.486 |
| 1439.0 | 0.486 |
| 1440.0 | 0.486 |
| 1441.0 | 0.486 |
| 1442.0 | 0.486 |
| 1443.0 | 0.486 |
| 1444.0 | 0.486 |
| 1445.0 | 0.486 |
| 1446.0 | 0.486 |
| 1447.0 | 0.486 |
| 1448.0 | 0.485 |
| 1449.0 | 0.485 |
| 1450.0 | 0.485 |
| 1451.0 | 0.485 |
| 1452.0 | 0.485 |
| 1453.0 | 0.485 |
| 1454.0 | 0.485 |
| 1455.0 | 0.485 |
| 1456.0 | 0.485 |
| 1457.0 | 0.485 |
| 1458.0 | 0.485 |
| 1459.0 | 0.485 |
| 1460.0 | 0.484 |
| 1461.0 | 0.484 |
| 1462.0 | 0.484 |
| 1463.0 | 0.484 |
| 1464.0 | 0.484 |
| 1465.0 | 0.484 |
| 1466.0 | 0.484 |
| 1467.0 | 0.484 |
| 1468.0 | 0.484 |
| 1469.0 | 0.484 |
| 1470.0 | 0.484 |
| 1471.0 | 0.483 |
| 1472.0 | 0.483 |
| 1473.0 | 0.483 |
| 1474.0 | 0.483 |
| 1475.0 | 0.483 |
| 1476.0 | 0.483 |
| 1477.0 | 0.483 |
| 1478.0 | 0.483 |
| 1479.0 | 0.483 |
| 1480.0 | 0.483 |
| 1481.0 | 0.483 |
| 1482.0 | 0.483 |
| 1483.0 | 0.482 |
| 1484.0 | 0.482 |
| 1485.0 | 0.482 |
| 1486.0 | 0.482 |
| 1487.0 | 0.482 |
| 1488.0 | 0.482 |
| 1489.0 | 0.482 |
| 1490.0 | 0.482 |
| 1491.0 | 0.482 |
| 1492.0 | 0.482 |
| 1493.0 | 0.482 |
| 1494.0 | 0.481 |
| 1495.0 | 0.481 |
| 1496.0 | 0.481 |
| 1497.0 | 0.481 |
| 1498.0 | 0.481 |
| 1499.0 | 0.481 |
| 1500.0 | 0.481 |
| 1501.0 | 0.481 |
| 1502.0 | 0.481 |
| 1503.0 | 0.481 |
| 1504.0 | 0.48 |
| 1505.0 | 0.48 |
| 1506.0 | 0.48 |
| 1507.0 | 0.48 |
| 1508.0 | 0.48 |
| 1509.0 | 0.48 |
| 1510.0 | 0.48 |
| 1511.0 | 0.48 |
| 1512.0 | 0.48 |
| 1513.0 | 0.48 |
| 1514.0 | 0.48 |
| 1515.0 | 0.479 |
| 1516.0 | 0.479 |
| 1517.0 | 0.479 |
| 1518.0 | 0.479 |
| 1519.0 | 0.479 |
| 1520.0 | 0.479 |
| 1521.0 | 0.479 |
| 1522.0 | 0.479 |
| 1523.0 | 0.479 |
| 1524.0 | 0.479 |
| 1525.0 | 0.478 |
| 1526.0 | 0.478 |
| 1527.0 | 0.478 |
| 1528.0 | 0.478 |
| 1529.0 | 0.478 |
| 1530.0 | 0.478 |
| 1531.0 | 0.478 |
| 1532.0 | 0.478 |
| 1533.0 | 0.478 |
| 1534.0 | 0.478 |
| 1535.0 | 0.477 |
| 1536.0 | 0.477 |
| 1537.0 | 0.477 |
| 1538.0 | 0.477 |
| 1539.0 | 0.477 |
| 1540.0 | 0.477 |
| 1541.0 | 0.477 |
| 1542.0 | 0.477 |
| 1543.0 | 0.477 |
| 1544.0 | 0.477 |
| 1545.0 | 0.476 |
| 1546.0 | 0.476 |
| 1547.0 | 0.476 |
| 1548.0 | 0.476 |
| 1549.0 | 0.476 |
| 1550.0 | 0.476 |
| 1551.0 | 0.476 |
| 1552.0 | 0.476 |
| 1553.0 | 0.476 |
| 1554.0 | 0.476 |
| 1555.0 | 0.475 |
| 1556.0 | 0.475 |
| 1557.0 | 0.475 |
| 1558.0 | 0.475 |
| 1559.0 | 0.475 |
| 1560.0 | 0.475 |
| 1561.0 | 0.475 |
| 1562.0 | 0.475 |
| 1563.0 | 0.475 |
| 1564.0 | 0.475 |
| 1565.0 | 0.474 |
| 1566.0 | 0.474 |
| 1567.0 | 0.474 |
| 1568.0 | 0.474 |
| 1569.0 | 0.474 |
| 1570.0 | 0.474 |
| 1571.0 | 0.474 |
| 1572.0 | 0.474 |
| 1573.0 | 0.474 |
| 1574.0 | 0.473 |
| 1575.0 | 0.473 |
| 1576.0 | 0.473 |
| 1577.0 | 0.473 |
| 1578.0 | 0.473 |
| 1579.0 | 0.473 |
| 1580.0 | 0.473 |
| 1581.0 | 0.473 |
| 1582.0 | 0.473 |
| 1583.0 | 0.473 |
| 1584.0 | 0.472 |
| 1585.0 | 0.472 |
| 1586.0 | 0.472 |
| 1587.0 | 0.472 |
| 1588.0 | 0.472 |
| 1589.0 | 0.472 |
| 1590.0 | 0.472 |
| 1591.0 | 0.472 |
| 1592.0 | 0.472 |
| 1593.0 | 0.471 |
| 1594.0 | 0.471 |
| 1595.0 | 0.471 |
| 1596.0 | 0.471 |
| 1597.0 | 0.471 |
| 1598.0 | 0.471 |
| 1599.0 | 0.471 |
| 1600.0 | 0.471 |
| 1601.0 | 0.471 |
| 1602.0 | 0.47 |
| 1603.0 | 0.47 |
| 1604.0 | 0.47 |
| 1605.0 | 0.47 |
| 1606.0 | 0.47 |
| 1607.0 | 0.47 |
| 1608.0 | 0.47 |
| 1609.0 | 0.47 |
| 1610.0 | 0.47 |
| 1611.0 | 0.469 |
| 1612.0 | 0.469 |
| 1613.0 | 0.469 |
| 1614.0 | 0.469 |
| 1615.0 | 0.469 |
| 1616.0 | 0.469 |
| 1617.0 | 0.469 |
| 1618.0 | 0.469 |
| 1619.0 | 0.469 |
| 1620.0 | 0.468 |
| 1621.0 | 0.468 |
| 1622.0 | 0.468 |
| 1623.0 | 0.468 |
| 1624.0 | 0.468 |
| 1625.0 | 0.468 |
| 1626.0 | 0.468 |
| 1627.0 | 0.468 |
| 1628.0 | 0.467 |
| 1629.0 | 0.467 |
| 1630.0 | 0.467 |
| 1631.0 | 0.467 |
| 1632.0 | 0.467 |
| 1633.0 | 0.467 |
| 1634.0 | 0.467 |
| 1635.0 | 0.467 |
| 1636.0 | 0.467 |
| 1637.0 | 0.466 |
| 1638.0 | 0.466 |
| 1639.0 | 0.466 |
| 1640.0 | 0.466 |
| 1641.0 | 0.466 |
| 1642.0 | 0.466 |
| 1643.0 | 0.466 |
| 1644.0 | 0.466 |
| 1645.0 | 0.465 |
| 1646.0 | 0.465 |
| 1647.0 | 0.465 |
| 1648.0 | 0.465 |
| 1649.0 | 0.465 |
| 1650.0 | 0.465 |
| 1651.0 | 0.465 |
| 1652.0 | 0.465 |
| 1653.0 | 0.465 |
| 1654.0 | 0.464 |
| 1655.0 | 0.464 |
| 1656.0 | 0.464 |
| 1657.0 | 0.464 |
| 1658.0 | 0.464 |
| 1659.0 | 0.464 |
| 1660.0 | 0.464 |
| 1661.0 | 0.464 |
| 1662.0 | 0.463 |
| 1663.0 | 0.463 |
| 1664.0 | 0.463 |
| 1665.0 | 0.463 |
| 1666.0 | 0.463 |
| 1667.0 | 0.463 |
| 1668.0 | 0.463 |
| 1669.0 | 0.463 |
| 1670.0 | 0.462 |
| 1671.0 | 0.462 |
| 1672.0 | 0.462 |
| 1673.0 | 0.462 |
| 1674.0 | 0.462 |
| 1675.0 | 0.462 |
| 1676.0 | 0.462 |
| 1677.0 | 0.462 |
| 1678.0 | 0.461 |
| 1679.0 | 0.461 |
| 1680.0 | 0.461 |
| 1681.0 | 0.461 |
| 1682.0 | 0.461 |
| 1683.0 | 0.461 |
| 1684.0 | 0.461 |
| 1685.0 | 0.461 |
| 1686.0 | 0.46 |
| 1687.0 | 0.46 |
| 1688.0 | 0.46 |
| 1689.0 | 0.46 |
| 1690.0 | 0.46 |
| 1691.0 | 0.46 |
| 1692.0 | 0.46 |
| 1693.0 | 0.459 |
| 1694.0 | 0.459 |
| 1695.0 | 0.459 |
| 1696.0 | 0.459 |
| 1697.0 | 0.459 |
| 1698.0 | 0.459 |
| 1699.0 | 0.459 |
| 1700.0 | 0.459 |
| 1701.0 | 0.458 |
| 1702.0 | 0.458 |
| 1703.0 | 0.458 |
| 1704.0 | 0.458 |
| 1705.0 | 0.458 |
| 1706.0 | 0.458 |
| 1707.0 | 0.458 |
| 1708.0 | 0.457 |
| 1709.0 | 0.457 |
| 1710.0 | 0.457 |
| 1711.0 | 0.457 |
| 1712.0 | 0.457 |
| 1713.0 | 0.457 |
| 1714.0 | 0.457 |
| 1715.0 | 0.457 |
| 1716.0 | 0.456 |
| 1717.0 | 0.456 |
| 1718.0 | 0.456 |
| 1719.0 | 0.456 |
| 1720.0 | 0.456 |
| 1721.0 | 0.456 |
| 1722.0 | 0.456 |
| 1723.0 | 0.455 |
| 1724.0 | 0.455 |
| 1725.0 | 0.455 |
| 1726.0 | 0.455 |
| 1727.0 | 0.455 |
| 1728.0 | 0.455 |
| 1729.0 | 0.455 |
| 1730.0 | 0.454 |
| 1731.0 | 0.454 |
| 1732.0 | 0.454 |
| 1733.0 | 0.454 |
| 1734.0 | 0.454 |
| 1735.0 | 0.454 |
| 1736.0 | 0.454 |
| 1737.0 | 0.453 |
| 1738.0 | 0.453 |
| 1739.0 | 0.453 |
| 1740.0 | 0.453 |
| 1741.0 | 0.453 |
| 1742.0 | 0.453 |
| 1743.0 | 0.453 |
| 1744.0 | 0.452 |
| 1745.0 | 0.452 |
| 1746.0 | 0.452 |
| 1747.0 | 0.452 |
| 1748.0 | 0.452 |
| 1749.0 | 0.452 |
| 1750.0 | 0.452 |
| 1751.0 | 0.451 |
| 1752.0 | 0.451 |
| 1753.0 | 0.451 |
| 1754.0 | 0.451 |
| 1755.0 | 0.451 |
| 1756.0 | 0.451 |
| 1757.0 | 0.451 |
| 1758.0 | 0.45 |
| 1759.0 | 0.45 |
| 1760.0 | 0.45 |
| 1761.0 | 0.45 |
| 1762.0 | 0.45 |
| 1763.0 | 0.45 |
| 1764.0 | 0.449 |
| 1765.0 | 0.449 |
| 1766.0 | 0.449 |
| 1767.0 | 0.449 |
| 1768.0 | 0.449 |
| 1769.0 | 0.449 |
| 1770.0 | 0.449 |
| 1771.0 | 0.448 |
| 1772.0 | 0.448 |
| 1773.0 | 0.448 |
| 1774.0 | 0.448 |
| 1775.0 | 0.448 |
| 1776.0 | 0.448 |
| 1777.0 | 0.447 |
| 1778.0 | 0.447 |
| 1779.0 | 0.447 |
| 1780.0 | 0.447 |
| 1781.0 | 0.447 |
| 1782.0 | 0.447 |
| 1783.0 | 0.447 |
| 1784.0 | 0.446 |
| 1785.0 | 0.446 |
| 1786.0 | 0.446 |
| 1787.0 | 0.446 |
| 1788.0 | 0.446 |
| 1789.0 | 0.446 |
| 1790.0 | 0.445 |
| 1791.0 | 0.445 |
| 1792.0 | 0.445 |
| 1793.0 | 0.445 |
| 1794.0 | 0.445 |
| 1795.0 | 0.445 |
| 1796.0 | 0.444 |
| 1797.0 | 0.444 |
| 1798.0 | 0.444 |
| 1799.0 | 0.444 |
| 1800.0 | 0.444 |
| 1801.0 | 0.444 |
| 1802.0 | 0.443 |
| 1803.0 | 0.443 |
| 1804.0 | 0.443 |
| 1805.0 | 0.443 |
| 1806.0 | 0.443 |
| 1807.0 | 0.443 |
| 1808.0 | 0.442 |
| 1809.0 | 0.442 |
| 1810.0 | 0.442 |
| 1811.0 | 0.442 |
| 1812.0 | 0.442 |
| 1813.0 | 0.442 |
| 1814.0 | 0.441 |
| 1815.0 | 0.441 |
| 1816.0 | 0.441 |
| 1817.0 | 0.441 |
| 1818.0 | 0.441 |
| 1819.0 | 0.44 |
| 1820.0 | 0.44 |
| 1821.0 | 0.44 |
| 1822.0 | 0.44 |
| 1823.0 | 0.44 |
| 1824.0 | 0.44 |
| 1825.0 | 0.439 |
| 1826.0 | 0.439 |
| 1827.0 | 0.439 |
| 1828.0 | 0.439 |
| 1829.0 | 0.439 |
| 1830.0 | 0.438 |
| 1831.0 | 0.438 |
| 1832.0 | 0.438 |
| 1833.0 | 0.438 |
| 1834.0 | 0.438 |
| 1835.0 | 0.438 |
| 1836.0 | 0.437 |
| 1837.0 | 0.437 |
| 1838.0 | 0.437 |
| 1839.0 | 0.437 |
| 1840.0 | 0.437 |
| 1841.0 | 0.436 |
| 1842.0 | 0.436 |
| 1843.0 | 0.436 |
| 1844.0 | 0.436 |
| 1845.0 | 0.436 |
| 1846.0 | 0.436 |
| 1847.0 | 0.435 |
| 1848.0 | 0.435 |
| 1849.0 | 0.435 |
| 1850.0 | 0.435 |
| 1851.0 | 0.435 |
| 1852.0 | 0.434 |
| 1853.0 | 0.434 |
| 1854.0 | 0.434 |
| 1855.0 | 0.434 |
| 1856.0 | 0.434 |
| 1857.0 | 0.433 |
| 1858.0 | 0.433 |
| 1859.0 | 0.433 |
| 1860.0 | 0.433 |
| 1861.0 | 0.433 |
| 1862.0 | 0.432 |
| 1863.0 | 0.432 |
| 1864.0 | 0.432 |
| 1865.0 | 0.432 |
| 1866.0 | 0.432 |
| 1867.0 | 0.431 |
| 1868.0 | 0.431 |
| 1869.0 | 0.431 |
| 1870.0 | 0.431 |
| 1871.0 | 0.431 |
| 1872.0 | 0.43 |
| 1873.0 | 0.43 |
| 1874.0 | 0.43 |
| 1875.0 | 0.43 |
| 1876.0 | 0.43 |
| 1877.0 | 0.429 |
| 1878.0 | 0.429 |
| 1879.0 | 0.429 |
| 1880.0 | 0.429 |
| 1881.0 | 0.428 |
| 1882.0 | 0.428 |
| 1883.0 | 0.428 |
| 1884.0 | 0.428 |
| 1885.0 | 0.428 |
| 1886.0 | 0.427 |
| 1887.0 | 0.427 |
| 1888.0 | 0.427 |
| 1889.0 | 0.427 |
| 1890.0 | 0.427 |
| 1891.0 | 0.426 |
| 1892.0 | 0.426 |
| 1893.0 | 0.426 |
| 1894.0 | 0.426 |
| 1895.0 | 0.425 |
| 1896.0 | 0.425 |
| 1897.0 | 0.425 |
| 1898.0 | 0.425 |
| 1899.0 | 0.425 |
| 1900.0 | 0.424 |
| 1901.0 | 0.424 |
| 1902.0 | 0.424 |
| 1903.0 | 0.424 |
| 1904.0 | 0.423 |
| 1905.0 | 0.423 |
| 1906.0 | 0.423 |
| 1907.0 | 0.423 |
| 1908.0 | 0.423 |
| 1909.0 | 0.422 |
| 1910.0 | 0.422 |
| 1911.0 | 0.422 |
| 1912.0 | 0.422 |
| 1913.0 | 0.421 |
| 1914.0 | 0.421 |
| 1915.0 | 0.421 |
| 1916.0 | 0.421 |
| 1917.0 | 0.42 |
| 1918.0 | 0.42 |
| 1919.0 | 0.42 |
| 1920.0 | 0.42 |
| 1921.0 | 0.419 |
| 1922.0 | 0.419 |
| 1923.0 | 0.419 |
| 1924.0 | 0.419 |
| 1925.0 | 0.418 |
| 1926.0 | 0.418 |
| 1927.0 | 0.418 |
| 1928.0 | 0.418 |
| 1929.0 | 0.417 |
| 1930.0 | 0.417 |
| 1931.0 | 0.417 |
| 1932.0 | 0.417 |
| 1933.0 | 0.417 |
| 1934.0 | 0.416 |
| 1935.0 | 0.416 |
| 1936.0 | 0.416 |
| 1937.0 | 0.416 |
| 1938.0 | 0.415 |
| 1939.0 | 0.415 |
| 1940.0 | 0.415 |
| 1941.0 | 0.414 |
| 1942.0 | 0.414 |
| 1943.0 | 0.414 |
| 1944.0 | 0.414 |
| 1945.0 | 0.413 |
| 1946.0 | 0.413 |
| 1947.0 | 0.413 |
| 1948.0 | 0.413 |
| 1949.0 | 0.412 |
| 1950.0 | 0.412 |
| 1951.0 | 0.412 |
| 1952.0 | 0.412 |
| 1953.0 | 0.411 |
| 1954.0 | 0.411 |
| 1955.0 | 0.411 |
| 1956.0 | 0.411 |
| 1957.0 | 0.41 |
| 1958.0 | 0.41 |
| 1959.0 | 0.41 |
| 1960.0 | 0.409 |
| 1961.0 | 0.409 |
| 1962.0 | 0.409 |
| 1963.0 | 0.409 |
| 1964.0 | 0.408 |
| 1965.0 | 0.408 |
| 1966.0 | 0.408 |
| 1967.0 | 0.408 |
| 1968.0 | 0.407 |
| 1969.0 | 0.407 |
| 1970.0 | 0.407 |
| 1971.0 | 0.406 |
| 1972.0 | 0.406 |
| 1973.0 | 0.406 |
| 1974.0 | 0.406 |
| 1975.0 | 0.405 |
| 1976.0 | 0.405 |
| 1977.0 | 0.405 |
| 1978.0 | 0.404 |
| 1979.0 | 0.404 |
| 1980.0 | 0.404 |
| 1981.0 | 0.404 |
| 1982.0 | 0.403 |
| 1983.0 | 0.403 |
| 1984.0 | 0.403 |
| 1985.0 | 0.402 |
| 1986.0 | 0.402 |
| 1987.0 | 0.402 |
| 1988.0 | 0.402 |
| 1989.0 | 0.401 |
| 1990.0 | 0.401 |
| 1991.0 | 0.401 |
| 1992.0 | 0.4 |
| 1993.0 | 0.4 |
| 1994.0 | 0.4 |
| 1995.0 | 0.399 |
| 1996.0 | 0.399 |
| 1997.0 | 0.399 |
| 1998.0 | 0.399 |
| 1999.0 | 0.398 |
| 2000.0 | 0.398 |
| 2001.0 | 0.398 |
| 2002.0 | 0.397 |
| 2003.0 | 0.397 |
| 2004.0 | 0.397 |
| 2005.0 | 0.396 |
| 2006.0 | 0.396 |
| 2007.0 | 0.396 |
| 2008.0 | 0.395 |
| 2009.0 | 0.395 |
| 2010.0 | 0.395 |
| 2011.0 | 0.395 |
| 2012.0 | 0.394 |
| 2013.0 | 0.394 |
| 2014.0 | 0.394 |
| 2015.0 | 0.393 |
| 2016.0 | 0.393 |
| 2017.0 | 0.393 |
| 2018.0 | 0.392 |
| 2019.0 | 0.392 |
| 2020.0 | 0.392 |
| 2021.0 | 0.391 |
| 2022.0 | 0.391 |
| 2023.0 | 0.391 |
| 2024.0 | 0.39 |
| 2025.0 | 0.39 |
| 2026.0 | 0.39 |
| 2027.0 | 0.389 |
| 2028.0 | 0.389 |
| 2029.0 | 0.389 |
| 2030.0 | 0.388 |
| 2031.0 | 0.388 |
| 2032.0 | 0.388 |
| 2033.0 | 0.387 |
| 2034.0 | 0.387 |
| 2035.0 | 0.387 |
| 2036.0 | 0.386 |
| 2037.0 | 0.386 |
| 2038.0 | 0.386 |
| 2039.0 | 0.385 |
| 2040.0 | 0.385 |
| 2041.0 | 0.385 |
| 2042.0 | 0.384 |
| 2043.0 | 0.384 |
| 2044.0 | 0.384 |
| 2045.0 | 0.383 |
| 2046.0 | 0.383 |
| 2047.0 | 0.383 |
| 2048.0 | 0.382 |
| 2049.0 | 0.382 |
| 2050.0 | 0.382 |
| 2051.0 | 0.381 |
| 2052.0 | 0.381 |
| 2053.0 | 0.38 |
| 2054.0 | 0.38 |
| 2055.0 | 0.38 |
| 2056.0 | 0.379 |
| 2057.0 | 0.379 |
| 2058.0 | 0.379 |
| 2059.0 | 0.378 |
| 2060.0 | 0.378 |
| 2061.0 | 0.378 |
| 2062.0 | 0.377 |
| 2063.0 | 0.377 |
| 2064.0 | 0.377 |
| 2065.0 | 0.376 |
| 2066.0 | 0.376 |
| 2067.0 | 0.375 |
| 2068.0 | 0.375 |
| 2069.0 | 0.375 |
| 2070.0 | 0.374 |
| 2071.0 | 0.374 |
| 2072.0 | 0.374 |
| 2073.0 | 0.373 |
| 2074.0 | 0.373 |
| 2075.0 | 0.372 |
| 2076.0 | 0.372 |
| 2077.0 | 0.372 |
| 2078.0 | 0.371 |
| 2079.0 | 0.371 |
| 2080.0 | 0.371 |
| 2081.0 | 0.37 |
| 2082.0 | 0.37 |
| 2083.0 | 0.369 |
| 2084.0 | 0.369 |
| 2085.0 | 0.369 |
| 2086.0 | 0.368 |
| 2087.0 | 0.368 |
| 2088.0 | 0.367 |
| 2089.0 | 0.367 |
| 2090.0 | 0.367 |
| 2091.0 | 0.366 |
| 2092.0 | 0.366 |
| 2093.0 | 0.365 |
| 2094.0 | 0.365 |
| 2095.0 | 0.365 |
| 2096.0 | 0.364 |
| 2097.0 | 0.364 |
| 2098.0 | 0.363 |
| 2099.0 | 0.363 |
| 2100.0 | 0.363 |
| 2101.0 | 0.362 |
| 2102.0 | 0.362 |
| 2103.0 | 0.361 |
| 2104.0 | 0.361 |
| 2105.0 | 0.361 |
| 2106.0 | 0.36 |
| 2107.0 | 0.36 |
| 2108.0 | 0.359 |
| 2109.0 | 0.359 |
| 2110.0 | 0.359 |
| 2111.0 | 0.358 |
| 2112.0 | 0.358 |
| 2113.0 | 0.357 |
| 2114.0 | 0.357 |
| 2115.0 | 0.357 |
| 2116.0 | 0.356 |
| 2117.0 | 0.356 |
| 2118.0 | 0.355 |
| 2119.0 | 0.355 |
| 2120.0 | 0.354 |
| 2121.0 | 0.354 |
| 2122.0 | 0.354 |
| 2123.0 | 0.353 |
| 2124.0 | 0.353 |
| 2125.0 | 0.352 |
| 2126.0 | 0.352 |
| 2127.0 | 0.351 |
| 2128.0 | 0.351 |
| 2129.0 | 0.351 |
| 2130.0 | 0.35 |
| 2131.0 | 0.35 |
| 2132.0 | 0.349 |
| 2133.0 | 0.349 |
| 2134.0 | 0.348 |
| 2135.0 | 0.348 |
| 2136.0 | 0.348 |
| 2137.0 | 0.347 |
| 2138.0 | 0.347 |
| 2139.0 | 0.346 |
| 2140.0 | 0.346 |
| 2141.0 | 0.345 |
| 2142.0 | 0.345 |
| 2143.0 | 0.344 |
| 2144.0 | 0.344 |
| 2145.0 | 0.344 |
| 2146.0 | 0.343 |
| 2147.0 | 0.343 |
| 2148.0 | 0.342 |
| 2149.0 | 0.342 |
| 2150.0 | 0.341 |
| 2151.0 | 0.341 |
| 2152.0 | 0.34 |
| 2153.0 | 0.34 |
| 2154.0 | 0.339 |
| 2155.0 | 0.339 |
| 2156.0 | 0.339 |
| 2157.0 | 0.338 |
| 2158.0 | 0.338 |
| 2159.0 | 0.337 |
| 2160.0 | 0.337 |
| 2161.0 | 0.336 |
| 2162.0 | 0.336 |
| 2163.0 | 0.335 |
| 2164.0 | 0.335 |
| 2165.0 | 0.334 |
| 2166.0 | 0.334 |
| 2167.0 | 0.333 |
| 2168.0 | 0.333 |
| 2169.0 | 0.333 |
| 2170.0 | 0.332 |
| 2171.0 | 0.332 |
| 2172.0 | 0.331 |
| 2173.0 | 0.331 |
| 2174.0 | 0.33 |
| 2175.0 | 0.33 |
| 2176.0 | 0.329 |
| 2177.0 | 0.329 |
| 2178.0 | 0.328 |
| 2179.0 | 0.328 |
| 2180.0 | 0.327 |
| 2181.0 | 0.327 |
| 2182.0 | 0.326 |
| 2183.0 | 0.326 |
| 2184.0 | 0.325 |
| 2185.0 | 0.325 |
| 2186.0 | 0.324 |
| 2187.0 | 0.324 |
| 2188.0 | 0.323 |
| 2189.0 | 0.323 |
| 2190.0 | 0.322 |
| 2191.0 | 0.322 |
| 2192.0 | 0.321 |
| 2193.0 | 0.321 |
| 2194.0 | 0.32 |
| 2195.0 | 0.32 |
| 2196.0 | 0.319 |
| 2197.0 | 0.319 |
| 2198.0 | 0.318 |
| 2199.0 | 0.318 |
| 2200.0 | 0.317 |
| 2201.0 | 0.317 |
| 2202.0 | 0.316 |
| 2203.0 | 0.316 |
| 2204.0 | 0.315 |
| 2205.0 | 0.315 |
| 2206.0 | 0.314 |
| 2207.0 | 0.314 |
| 2208.0 | 0.313 |
| 2209.0 | 0.313 |
| 2210.0 | 0.312 |
| 2211.0 | 0.312 |
| 2212.0 | 0.311 |
| 2213.0 | 0.311 |
| 2214.0 | 0.31 |
| 2215.0 | 0.31 |
| 2216.0 | 0.309 |
| 2217.0 | 0.309 |
| 2218.0 | 0.308 |
| 2219.0 | 0.308 |
| 2220.0 | 0.307 |
| 2221.0 | 0.307 |
| 2222.0 | 0.306 |
| 2223.0 | 0.306 |
| 2224.0 | 0.305 |
| 2225.0 | 0.305 |
| 2226.0 | 0.304 |
| 2227.0 | 0.304 |
| 2228.0 | 0.303 |
| 2229.0 | 0.303 |
| 2230.0 | 0.302 |
| 2231.0 | 0.302 |
| 2232.0 | 0.301 |
| 2233.0 | 0.301 |
| 2234.0 | 0.3 |
| 2235.0 | 0.299 |
| 2236.0 | 0.299 |
| 2237.0 | 0.298 |
| 2238.0 | 0.298 |
| 2239.0 | 0.297 |
| 2240.0 | 0.297 |
| 2241.0 | 0.296 |
| 2242.0 | 0.296 |
| 2243.0 | 0.295 |
| 2244.0 | 0.295 |
| 2245.0 | 0.294 |
| 2246.0 | 0.294 |
| 2247.0 | 0.293 |
| 2248.0 | 0.293 |
| 2249.0 | 0.292 |
| 2250.0 | 0.291 |
| 2251.0 | 0.291 |
| 2252.0 | 0.29 |
| 2253.0 | 0.29 |
| 2254.0 | 0.289 |
| 2255.0 | 0.289 |
| 2256.0 | 0.288 |
| 2257.0 | 0.288 |
| 2258.0 | 0.287 |
| 2259.0 | 0.287 |
| 2260.0 | 0.286 |
| 2261.0 | 0.286 |
| 2262.0 | 0.285 |
| 2263.0 | 0.284 |
| 2264.0 | 0.284 |
| 2265.0 | 0.283 |
| 2266.0 | 0.283 |
| 2267.0 | 0.282 |
| 2268.0 | 0.282 |
| 2269.0 | 0.281 |
| 2270.0 | 0.281 |
| 2271.0 | 0.28 |
| 2272.0 | 0.28 |
| 2273.0 | 0.279 |
| 2274.0 | 0.278 |
| 2275.0 | 0.278 |
| 2276.0 | 0.277 |
| 2277.0 | 0.277 |
| 2278.0 | 0.276 |
| 2279.0 | 0.276 |
| 2280.0 | 0.275 |
| 2281.0 | 0.275 |
| 2282.0 | 0.274 |
| 2283.0 | 0.273 |
| 2284.0 | 0.273 |
| 2285.0 | 0.272 |
| 2286.0 | 0.272 |
| 2287.0 | 0.271 |
| 2288.0 | 0.271 |
| 2289.0 | 0.27 |
| 2290.0 | 0.27 |
| 2291.0 | 0.269 |
| 2292.0 | 0.268 |
| 2293.0 | 0.268 |
| 2294.0 | 0.267 |
| 2295.0 | 0.267 |
| 2296.0 | 0.266 |
| 2297.0 | 0.266 |
| 2298.0 | 0.265 |
| 2299.0 | 0.265 |
| 2300.0 | 0.264 |
| 2301.0 | 0.263 |
| 2302.0 | 0.263 |
| 2303.0 | 0.262 |
| 2304.0 | 0.262 |
| 2305.0 | 0.261 |
| 2306.0 | 0.261 |
| 2307.0 | 0.26 |
| 2308.0 | 0.259 |
| 2309.0 | 0.259 |
| 2310.0 | 0.258 |
| 2311.0 | 0.258 |
| 2312.0 | 0.257 |
| 2313.0 | 0.257 |
| 2314.0 | 0.256 |
| 2315.0 | 0.256 |
| 2316.0 | 0.255 |
| 2317.0 | 0.254 |
| 2318.0 | 0.254 |
| 2319.0 | 0.253 |
| 2320.0 | 0.253 |
| 2321.0 | 0.252 |
| 2322.0 | 0.252 |
| 2323.0 | 0.251 |
| 2324.0 | 0.251 |
| 2325.0 | 0.25 |
| 2326.0 | 0.249 |
| 2327.0 | 0.249 |
| 2328.0 | 0.248 |
| 2329.0 | 0.248 |
| 2330.0 | 0.247 |
| 2331.0 | 0.247 |
| 2332.0 | 0.246 |
| 2333.0 | 0.245 |
| 2334.0 | 0.245 |
| 2335.0 | 0.244 |
| 2336.0 | 0.244 |
| 2337.0 | 0.243 |
| 2338.0 | 0.243 |
| 2339.0 | 0.242 |
| 2340.0 | 0.242 |
| 2341.0 | 0.241 |
| 2342.0 | 0.24 |
| 2343.0 | 0.24 |
| 2344.0 | 0.239 |
| 2345.0 | 0.239 |
| 2346.0 | 0.238 |
| 2347.0 | 0.238 |
| 2348.0 | 0.237 |
| 2349.0 | 0.236 |
| 2350.0 | 0.236 |
| 2351.0 | 0.235 |
| 2352.0 | 0.235 |
| 2353.0 | 0.234 |
| 2354.0 | 0.234 |
| 2355.0 | 0.233 |
| 2356.0 | 0.233 |
| 2357.0 | 0.232 |
| 2358.0 | 0.231 |
| 2359.0 | 0.231 |
| 2360.0 | 0.23 |
| 2361.0 | 0.23 |
| 2362.0 | 0.229 |
| 2363.0 | 0.229 |
| 2364.0 | 0.228 |
| 2365.0 | 0.228 |
| 2366.0 | 0.227 |
| 2367.0 | 0.226 |
| 2368.0 | 0.226 |
| 2369.0 | 0.225 |
| 2370.0 | 0.225 |
| 2371.0 | 0.224 |
| 2372.0 | 0.224 |
| 2373.0 | 0.223 |
| 2374.0 | 0.223 |
| 2375.0 | 0.222 |
| 2376.0 | 0.222 |
| 2377.0 | 0.221 |
| 2378.0 | 0.22 |
| 2379.0 | 0.22 |
| 2380.0 | 0.219 |
| 2381.0 | 0.219 |
| 2382.0 | 0.218 |
| 2383.0 | 0.218 |
| 2384.0 | 0.217 |
| 2385.0 | 0.217 |
| 2386.0 | 0.216 |
| 2387.0 | 0.216 |
| 2388.0 | 0.215 |
| 2389.0 | 0.214 |
| 2390.0 | 0.214 |
| 2391.0 | 0.213 |
| 2392.0 | 0.213 |
| 2393.0 | 0.212 |
| 2394.0 | 0.212 |
| 2395.0 | 0.211 |
| 2396.0 | 0.211 |
| 2397.0 | 0.21 |
| 2398.0 | 0.21 |
| 2399.0 | 0.209 |
| 2400.0 | 0.209 |
| 2401.0 | 0.208 |
| 2402.0 | 0.207 |
| 2403.0 | 0.207 |
| 2404.0 | 0.206 |
| 2405.0 | 0.206 |
| 2406.0 | 0.205 |
| 2407.0 | 0.205 |
| 2408.0 | 0.204 |
| 2409.0 | 0.204 |
| 2410.0 | 0.203 |
| 2411.0 | 0.203 |
| 2412.0 | 0.202 |
| 2413.0 | 0.202 |
| 2414.0 | 0.201 |
| 2415.0 | 0.201 |
| 2416.0 | 0.2 |
| 2417.0 | 0.2 |
| 2418.0 | 0.199 |
| 2419.0 | 0.198 |
| 2420.0 | 0.198 |
| 2421.0 | 0.197 |
| 2422.0 | 0.197 |
| 2423.0 | 0.196 |
| 2424.0 | 0.196 |
| 2425.0 | 0.195 |
| 2426.0 | 0.195 |
| 2427.0 | 0.194 |
| 2428.0 | 0.194 |
| 2429.0 | 0.193 |
| 2430.0 | 0.193 |
| 2431.0 | 0.192 |
| 2432.0 | 0.192 |
| 2433.0 | 0.191 |
| 2434.0 | 0.191 |
| 2435.0 | 0.19 |
| 2436.0 | 0.19 |
| 2437.0 | 0.189 |
| 2438.0 | 0.189 |
| 2439.0 | 0.188 |
| 2440.0 | 0.188 |
| 2441.0 | 0.187 |
| 2442.0 | 0.187 |
| 2443.0 | 0.186 |
| 2444.0 | 0.186 |
| 2445.0 | 0.185 |
| 2446.0 | 0.185 |
| 2447.0 | 0.184 |
| 2448.0 | 0.184 |
| 2449.0 | 0.183 |
| 2450.0 | 0.183 |
| 2451.0 | 0.182 |
| 2452.0 | 0.182 |
| 2453.0 | 0.181 |
| 2454.0 | 0.181 |
| 2455.0 | 0.18 |
| 2456.0 | 0.18 |
| 2457.0 | 0.179 |
| 2458.0 | 0.179 |
| 2459.0 | 0.178 |
| 2460.0 | 0.178 |
| 2461.0 | 0.178 |
| 2462.0 | 0.177 |
| 2463.0 | 0.177 |
| 2464.0 | 0.176 |
| 2465.0 | 0.176 |
| 2466.0 | 0.175 |
| 2467.0 | 0.175 |
| 2468.0 | 0.174 |
| 2469.0 | 0.174 |
| 2470.0 | 0.173 |
| 2471.0 | 0.173 |
| 2472.0 | 0.172 |
| 2473.0 | 0.172 |
| 2474.0 | 0.171 |
| 2475.0 | 0.171 |
| 2476.0 | 0.17 |
| 2477.0 | 0.17 |
| 2478.0 | 0.17 |
| 2479.0 | 0.169 |
| 2480.0 | 0.169 |
| 2481.0 | 0.168 |
| 2482.0 | 0.168 |
| 2483.0 | 0.167 |
| 2484.0 | 0.167 |
| 2485.0 | 0.166 |
| 2486.0 | 0.166 |
| 2487.0 | 0.165 |
| 2488.0 | 0.165 |
| 2489.0 | 0.165 |
| 2490.0 | 0.164 |
| 2491.0 | 0.164 |
| 2492.0 | 0.163 |
| 2493.0 | 0.163 |
| 2494.0 | 0.162 |
| 2495.0 | 0.162 |
| 2496.0 | 0.161 |
| 2497.0 | 0.161 |
| 2498.0 | 0.161 |
| 2499.0 | 0.16 |
| 2500.0 | 0.16 |
| 2501.0 | 0.159 |
| 2502.0 | 0.159 |
| 2503.0 | 0.158 |
| 2504.0 | 0.158 |
| 2505.0 | 0.158 |
| 2506.0 | 0.157 |
| 2507.0 | 0.157 |
| 2508.0 | 0.156 |
| 2509.0 | 0.156 |
| 2510.0 | 0.155 |
| 2511.0 | 0.155 |
| 2512.0 | 0.155 |
| 2513.0 | 0.154 |
| 2514.0 | 0.154 |
| 2515.0 | 0.153 |
| 2516.0 | 0.153 |
| 2517.0 | 0.153 |
| 2518.0 | 0.152 |
| 2519.0 | 0.152 |
| 2520.0 | 0.151 |
| 2521.0 | 0.151 |
| 2522.0 | 0.15 |
| 2523.0 | 0.15 |
| 2524.0 | 0.15 |
| 2525.0 | 0.149 |
| 2526.0 | 0.149 |
| 2527.0 | 0.148 |
| 2528.0 | 0.148 |
| 2529.0 | 0.148 |
| 2530.0 | 0.147 |
| 2531.0 | 0.147 |
| 2532.0 | 0.146 |
| 2533.0 | 0.146 |
| 2534.0 | 0.146 |
| 2535.0 | 0.145 |
| 2536.0 | 0.145 |
| 2537.0 | 0.144 |
| 2538.0 | 0.144 |
| 2539.0 | 0.144 |
| 2540.0 | 0.143 |
| 2541.0 | 0.143 |
| 2542.0 | 0.143 |
| 2543.0 | 0.142 |
| 2544.0 | 0.142 |
| 2545.0 | 0.141 |
| 2546.0 | 0.141 |
| 2547.0 | 0.141 |
| 2548.0 | 0.14 |
| 2549.0 | 0.14 |
| 2550.0 | 0.14 |
| 2551.0 | 0.139 |
| 2552.0 | 0.139 |
| 2553.0 | 0.138 |
| 2554.0 | 0.138 |
| 2555.0 | 0.138 |
| 2556.0 | 0.137 |
| 2557.0 | 0.137 |
| 2558.0 | 0.137 |
| 2559.0 | 0.136 |
| 2560.0 | 0.136 |
| 2561.0 | 0.136 |
| 2562.0 | 0.135 |
| 2563.0 | 0.135 |
| 2564.0 | 0.134 |
| 2565.0 | 0.134 |
| 2566.0 | 0.134 |
| 2567.0 | 0.133 |
| 2568.0 | 0.133 |
| 2569.0 | 0.133 |
| 2570.0 | 0.132 |
| 2571.0 | 0.132 |
| 2572.0 | 0.132 |
| 2573.0 | 0.131 |
| 2574.0 | 0.131 |
| 2575.0 | 0.131 |
| 2576.0 | 0.13 |
| 2577.0 | 0.13 |
| 2578.0 | 0.13 |
| 2579.0 | 0.129 |
| 2580.0 | 0.129 |
| 2581.0 | 0.129 |
| 2582.0 | 0.128 |
| 2583.0 | 0.128 |
| 2584.0 | 0.128 |
| 2585.0 | 0.127 |
| 2586.0 | 0.127 |
| 2587.0 | 0.127 |
| 2588.0 | 0.126 |
| 2589.0 | 0.126 |
| 2590.0 | 0.126 |
| 2591.0 | 0.125 |
| 2592.0 | 0.125 |
| 2593.0 | 0.125 |
| 2594.0 | 0.124 |
| 2595.0 | 0.124 |
| 2596.0 | 0.124 |
| 2597.0 | 0.123 |
| 2598.0 | 0.123 |
| 2599.0 | 0.123 |
| 2600.0 | 0.122 |
| 2601.0 | 0.122 |
| 2602.0 | 0.122 |
| 2603.0 | 0.121 |
| 2604.0 | 0.121 |
| 2605.0 | 0.121 |
| 2606.0 | 0.12 |
| 2607.0 | 0.12 |
| 2608.0 | 0.12 |
| 2609.0 | 0.12 |
| 2610.0 | 0.119 |
| 2611.0 | 0.119 |
| 2612.0 | 0.119 |
| 2613.0 | 0.118 |
| 2614.0 | 0.118 |
| 2615.0 | 0.118 |
| 2616.0 | 0.117 |
| 2617.0 | 0.117 |
| 2618.0 | 0.117 |
| 2619.0 | 0.117 |
| 2620.0 | 0.116 |
| 2621.0 | 0.116 |
| 2622.0 | 0.116 |
| 2623.0 | 0.115 |
| 2624.0 | 0.115 |
| 2625.0 | 0.115 |
| 2626.0 | 0.114 |
| 2627.0 | 0.114 |
| 2628.0 | 0.114 |
| 2629.0 | 0.114 |
| 2630.0 | 0.113 |
| 2631.0 | 0.113 |
| 2632.0 | 0.113 |
| 2633.0 | 0.112 |
| 2634.0 | 0.112 |
| 2635.0 | 0.112 |
| 2636.0 | 0.112 |
| 2637.0 | 0.111 |
| 2638.0 | 0.111 |
| 2639.0 | 0.111 |
| 2640.0 | 0.111 |
| 2641.0 | 0.11 |
| 2642.0 | 0.11 |
| 2643.0 | 0.11 |
| 2644.0 | 0.109 |
| 2645.0 | 0.109 |
| 2646.0 | 0.109 |
| 2647.0 | 0.109 |
| 2648.0 | 0.108 |
| 2649.0 | 0.108 |
| 2650.0 | 0.108 |
| 2651.0 | 0.108 |
| 2652.0 | 0.107 |
| 2653.0 | 0.107 |
| 2654.0 | 0.107 |
| 2655.0 | 0.106 |
| 2656.0 | 0.106 |
| 2657.0 | 0.106 |
| 2658.0 | 0.106 |
| 2659.0 | 0.105 |
| 2660.0 | 0.105 |
| 2661.0 | 0.105 |
| 2662.0 | 0.105 |
| 2663.0 | 0.104 |
| 2664.0 | 0.104 |
| 2665.0 | 0.104 |
| 2666.0 | 0.104 |
| 2667.0 | 0.103 |
| 2668.0 | 0.103 |
| 2669.0 | 0.103 |
| 2670.0 | 0.103 |
| 2671.0 | 0.102 |
| 2672.0 | 0.102 |
| 2673.0 | 0.102 |
| 2674.0 | 0.102 |
| 2675.0 | 0.101 |
| 2676.0 | 0.101 |
| 2677.0 | 0.101 |
| 2678.0 | 0.101 |
| 2679.0 | 0.1 |
| 2680.0 | 0.1 |
| 2681.0 | 0.1 |
| 2682.0 | 0.1 |
| 2683.0 | 0.1 |
| 2684.0 | 0.099 |
| 2685.0 | 0.099 |
| 2686.0 | 0.099 |
| 2687.0 | 0.099 |
| 2688.0 | 0.098 |
| 2689.0 | 0.098 |
| 2690.0 | 0.098 |
| 2691.0 | 0.098 |
| 2692.0 | 0.097 |
| 2693.0 | 0.097 |
| 2694.0 | 0.097 |
| 2695.0 | 0.097 |
| 2696.0 | 0.096 |
| 2697.0 | 0.096 |
| 2698.0 | 0.096 |
| 2699.0 | 0.096 |
| 2700.0 | 0.096 |
| 2701.0 | 0.095 |
| 2702.0 | 0.095 |
| 2703.0 | 0.095 |
| 2704.0 | 0.095 |
| 2705.0 | 0.094 |
| 2706.0 | 0.094 |
| 2707.0 | 0.094 |
| 2708.0 | 0.094 |
| 2709.0 | 0.094 |
| 2710.0 | 0.093 |
| 2711.0 | 0.093 |
| 2712.0 | 0.093 |
| 2713.0 | 0.093 |
| 2714.0 | 0.093 |
| 2715.0 | 0.092 |
| 2716.0 | 0.092 |
| 2717.0 | 0.092 |
| 2718.0 | 0.092 |
| 2719.0 | 0.091 |
| 2720.0 | 0.091 |
| 2721.0 | 0.091 |
| 2722.0 | 0.091 |
| 2723.0 | 0.091 |
| 2724.0 | 0.09 |
| 2725.0 | 0.09 |
| 2726.0 | 0.09 |
| 2727.0 | 0.09 |
| 2728.0 | 0.09 |
| 2729.0 | 0.089 |
| 2730.0 | 0.089 |
| 2731.0 | 0.089 |
| 2732.0 | 0.089 |
| 2733.0 | 0.089 |
| 2734.0 | 0.088 |
| 2735.0 | 0.088 |
| 2736.0 | 0.088 |
| 2737.0 | 0.088 |
| 2738.0 | 0.088 |
| 2739.0 | 0.087 |
| 2740.0 | 0.087 |
| 2741.0 | 0.087 |
| 2742.0 | 0.087 |
| 2743.0 | 0.087 |
| 2744.0 | 0.086 |
| 2745.0 | 0.086 |
| 2746.0 | 0.086 |
| 2747.0 | 0.086 |
| 2748.0 | 0.086 |
| 2749.0 | 0.086 |
| 2750.0 | 0.085 |
| 2751.0 | 0.085 |
| 2752.0 | 0.085 |
| 2753.0 | 0.085 |
| 2754.0 | 0.085 |
| 2755.0 | 0.084 |
| 2756.0 | 0.084 |
| 2757.0 | 0.084 |
| 2758.0 | 0.084 |
| 2759.0 | 0.084 |
| 2760.0 | 0.083 |
| 2761.0 | 0.083 |
| 2762.0 | 0.083 |
| 2763.0 | 0.083 |
| 2764.0 | 0.083 |
| 2765.0 | 0.083 |
| 2766.0 | 0.082 |
| 2767.0 | 0.082 |
| 2768.0 | 0.082 |
| 2769.0 | 0.082 |
| 2770.0 | 0.082 |
| 2771.0 | 0.082 |
| 2772.0 | 0.081 |
| 2773.0 | 0.081 |
| 2774.0 | 0.081 |
| 2775.0 | 0.081 |
| 2776.0 | 0.081 |
| 2777.0 | 0.08 |
| 2778.0 | 0.08 |
| 2779.0 | 0.08 |
| 2780.0 | 0.08 |
| 2781.0 | 0.08 |
| 2782.0 | 0.08 |
| 2783.0 | 0.079 |
| 2784.0 | 0.079 |
| 2785.0 | 0.079 |
| 2786.0 | 0.079 |
| 2787.0 | 0.079 |
| 2788.0 | 0.079 |
| 2789.0 | 0.078 |
| 2790.0 | 0.078 |
| 2791.0 | 0.078 |
| 2792.0 | 0.078 |
| 2793.0 | 0.078 |
| 2794.0 | 0.078 |
| 2795.0 | 0.077 |
| 2796.0 | 0.077 |
| 2797.0 | 0.077 |
| 2798.0 | 0.077 |
| 2799.0 | 0.077 |
| 2800.0 | 0.077 |
| 2801.0 | 0.077 |
| 2802.0 | 0.076 |
| 2803.0 | 0.076 |
| 2804.0 | 0.076 |
| 2805.0 | 0.076 |
| 2806.0 | 0.076 |
| 2807.0 | 0.076 |
| 2808.0 | 0.075 |
| 2809.0 | 0.075 |
| 2810.0 | 0.075 |
| 2811.0 | 0.075 |
| 2812.0 | 0.075 |
| 2813.0 | 0.075 |
| 2814.0 | 0.074 |
| 2815.0 | 0.074 |
| 2816.0 | 0.074 |
| 2817.0 | 0.074 |
| 2818.0 | 0.074 |
| 2819.0 | 0.074 |
| 2820.0 | 0.074 |
| 2821.0 | 0.073 |
| 2822.0 | 0.073 |
| 2823.0 | 0.073 |
| 2824.0 | 0.073 |
| 2825.0 | 0.073 |
| 2826.0 | 0.073 |
| 2827.0 | 0.073 |
| 2828.0 | 0.072 |
| 2829.0 | 0.072 |
| 2830.0 | 0.072 |
| 2831.0 | 0.072 |
| 2832.0 | 0.072 |
| 2833.0 | 0.072 |
| 2834.0 | 0.072 |
| 2835.0 | 0.071 |
| 2836.0 | 0.071 |
| 2837.0 | 0.071 |
| 2838.0 | 0.071 |
| 2839.0 | 0.071 |
| 2840.0 | 0.071 |
| 2841.0 | 0.071 |
| 2842.0 | 0.07 |
| 2843.0 | 0.07 |
| 2844.0 | 0.07 |
| 2845.0 | 0.07 |
| 2846.0 | 0.07 |
| 2847.0 | 0.07 |
| 2848.0 | 0.07 |
| 2849.0 | 0.069 |
| 2850.0 | 0.069 |
| 2851.0 | 0.069 |
| 2852.0 | 0.069 |
| 2853.0 | 0.069 |
| 2854.0 | 0.069 |
| 2855.0 | 0.069 |
| 2856.0 | 0.069 |
| 2857.0 | 0.068 |
| 2858.0 | 0.068 |
| 2859.0 | 0.068 |
| 2860.0 | 0.068 |
| 2861.0 | 0.068 |
| 2862.0 | 0.068 |
| 2863.0 | 0.068 |
| 2864.0 | 0.067 |
| 2865.0 | 0.067 |
| 2866.0 | 0.067 |
| 2867.0 | 0.067 |
| 2868.0 | 0.067 |
| 2869.0 | 0.067 |
| 2870.0 | 0.067 |
| 2871.0 | 0.067 |
| 2872.0 | 0.066 |
| 2873.0 | 0.066 |
| 2874.0 | 0.066 |
| 2875.0 | 0.066 |
| 2876.0 | 0.066 |
| 2877.0 | 0.066 |
| 2878.0 | 0.066 |
| 2879.0 | 0.066 |
| 2880.0 | 0.065 |
| 2881.0 | 0.065 |
| 2882.0 | 0.065 |
| 2883.0 | 0.065 |
| 2884.0 | 0.065 |
| 2885.0 | 0.065 |
| 2886.0 | 0.065 |
| 2887.0 | 0.065 |
| 2888.0 | 0.064 |
| 2889.0 | 0.064 |
| 2890.0 | 0.064 |
| 2891.0 | 0.064 |
| 2892.0 | 0.064 |
| 2893.0 | 0.064 |
| 2894.0 | 0.064 |
| 2895.0 | 0.064 |
| 2896.0 | 0.064 |
| 2897.0 | 0.063 |
| 2898.0 | 0.063 |
| 2899.0 | 0.063 |
| 2900.0 | 0.063 |
| 2901.0 | 0.063 |
| 2902.0 | 0.063 |
| 2903.0 | 0.063 |
| 2904.0 | 0.063 |
| 2905.0 | 0.062 |
| 2906.0 | 0.062 |
| 2907.0 | 0.062 |
| 2908.0 | 0.062 |
| 2909.0 | 0.062 |
| 2910.0 | 0.062 |
| 2911.0 | 0.062 |
| 2912.0 | 0.062 |
| 2913.0 | 0.062 |
| 2914.0 | 0.061 |
| 2915.0 | 0.061 |
| 2916.0 | 0.061 |
| 2917.0 | 0.061 |
| 2918.0 | 0.061 |
| 2919.0 | 0.061 |
| 2920.0 | 0.061 |
| 2921.0 | 0.061 |
| 2922.0 | 0.061 |
| 2923.0 | 0.06 |
| 2924.0 | 0.06 |
| 2925.0 | 0.06 |
| 2926.0 | 0.06 |
| 2927.0 | 0.06 |
| 2928.0 | 0.06 |
| 2929.0 | 0.06 |
| 2930.0 | 0.06 |
| 2931.0 | 0.06 |
| 2932.0 | 0.06 |
| 2933.0 | 0.059 |
| 2934.0 | 0.059 |
| 2935.0 | 0.059 |
| 2936.0 | 0.059 |
| 2937.0 | 0.059 |
| 2938.0 | 0.059 |
| 2939.0 | 0.059 |
| 2940.0 | 0.059 |
| 2941.0 | 0.059 |
| 2942.0 | 0.058 |
| 2943.0 | 0.058 |
| 2944.0 | 0.058 |
| 2945.0 | 0.058 |
| 2946.0 | 0.058 |
| 2947.0 | 0.058 |
| 2948.0 | 0.058 |
| 2949.0 | 0.058 |
| 2950.0 | 0.058 |
| 2951.0 | 0.058 |
| 2952.0 | 0.057 |
| 2953.0 | 0.057 |
| 2954.0 | 0.057 |
| 2955.0 | 0.057 |
| 2956.0 | 0.057 |
| 2957.0 | 0.057 |
| 2958.0 | 0.057 |
| 2959.0 | 0.057 |
| 2960.0 | 0.057 |
| 2961.0 | 0.057 |
| 2962.0 | 0.056 |
| 2963.0 | 0.056 |
| 2964.0 | 0.056 |
| 2965.0 | 0.056 |
| 2966.0 | 0.056 |
| 2967.0 | 0.056 |
| 2968.0 | 0.056 |
| 2969.0 | 0.056 |
| 2970.0 | 0.056 |
| 2971.0 | 0.056 |
| 2972.0 | 0.056 |
| 2973.0 | 0.055 |
| 2974.0 | 0.055 |
| 2975.0 | 0.055 |
| 2976.0 | 0.055 |
| 2977.0 | 0.055 |
| 2978.0 | 0.055 |
| 2979.0 | 0.055 |
| 2980.0 | 0.055 |
| 2981.0 | 0.055 |
| 2982.0 | 0.055 |
| 2983.0 | 0.055 |
| 2984.0 | 0.054 |
| 2985.0 | 0.054 |
| 2986.0 | 0.054 |
| 2987.0 | 0.054 |
| 2988.0 | 0.054 |
| 2989.0 | 0.054 |
| 2990.0 | 0.054 |
| 2991.0 | 0.054 |
| 2992.0 | 0.054 |
| 2993.0 | 0.054 |
| 2994.0 | 0.054 |
| 2995.0 | 0.053 |
| 2996.0 | 0.053 |
| 2997.0 | 0.053 |
| 2998.0 | 0.053 |
| 2999.0 | 0.053 |
| 3000.0 | 0.053 |
| 3001.0 | 0.053 |
| 3002.0 | 0.053 |
| 3003.0 | 0.053 |
| 3004.0 | 0.053 |
| 3005.0 | 0.053 |
| 3006.0 | 0.052 |
| 3007.0 | 0.052 |
| 3008.0 | 0.052 |
| 3009.0 | 0.052 |
| 3010.0 | 0.052 |
| 3011.0 | 0.052 |
| 3012.0 | 0.052 |
| 3013.0 | 0.052 |
| 3014.0 | 0.052 |
| 3015.0 | 0.052 |
| 3016.0 | 0.052 |
| 3017.0 | 0.052 |
| 3018.0 | 0.051 |
| 3019.0 | 0.051 |
| 3020.0 | 0.051 |
| 3021.0 | 0.051 |
| 3022.0 | 0.051 |
| 3023.0 | 0.051 |
| 3024.0 | 0.051 |
| 3025.0 | 0.051 |
| 3026.0 | 0.051 |
| 3027.0 | 0.051 |
| 3028.0 | 0.051 |
| 3029.0 | 0.051 |
| 3030.0 | 0.051 |
| 3031.0 | 0.05 |
| 3032.0 | 0.05 |
| 3033.0 | 0.05 |
| 3034.0 | 0.05 |
| 3035.0 | 0.05 |
| 3036.0 | 0.05 |
| 3037.0 | 0.05 |